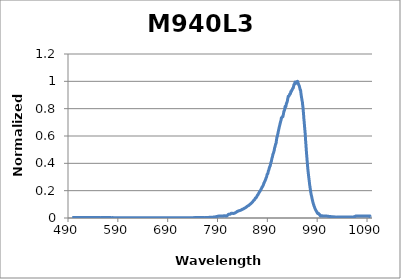
| Category | Normalized Intensity |
|---|---|
| 498.55860471 | 0.004 |
| 498.71212789 | 0.004 |
| 498.86566035 | 0.004 |
| 499.01920208 | 0.004 |
| 499.17275308 | 0.004 |
| 499.32631335 | 0.004 |
| 499.47988288 | 0.004 |
| 499.63346167 | 0.004 |
| 499.78704972 | 0.004 |
| 499.94064703 | 0.004 |
| 500.0942536 | 0.004 |
| 500.24786941 | 0.004 |
| 500.40149447 | 0.004 |
| 500.55512877 | 0.004 |
| 500.70877232 | 0.004 |
| 500.8624251 | 0.004 |
| 501.01608712 | 0.004 |
| 501.16975838 | 0.004 |
| 501.32343886 | 0.004 |
| 501.47712857 | 0.004 |
| 501.63082751 | 0.004 |
| 501.78453567 | 0.004 |
| 501.93825305 | 0.004 |
| 502.09197964 | 0.004 |
| 502.24571545 | 0.004 |
| 502.39946046 | 0.004 |
| 502.55321469 | 0.004 |
| 502.70697812 | 0.004 |
| 502.86075075 | 0.004 |
| 503.01453258 | 0.004 |
| 503.1683236 | 0.004 |
| 503.32212382 | 0.004 |
| 503.47593323 | 0.004 |
| 503.62975183 | 0.004 |
| 503.78357961 | 0.004 |
| 503.93741657 | 0.004 |
| 504.09126271 | 0.004 |
| 504.24511803 | 0.004 |
| 504.39898252 | 0.004 |
| 504.55285618 | 0.004 |
| 504.70673901 | 0.004 |
| 504.860631 | 0.004 |
| 505.01453216 | 0.004 |
| 505.16844247 | 0.004 |
| 505.32236194 | 0.004 |
| 505.47629056 | 0.004 |
| 505.63022834 | 0.004 |
| 505.78417526 | 0.004 |
| 505.93813132 | 0.004 |
| 506.09209653 | 0.004 |
| 506.24607088 | 0.004 |
| 506.40005436 | 0.004 |
| 506.55404697 | 0.004 |
| 506.70804872 | 0.004 |
| 506.86205959 | 0.004 |
| 507.01607959 | 0.004 |
| 507.17010871 | 0.004 |
| 507.32414695 | 0.004 |
| 507.4781943 | 0.004 |
| 507.63225077 | 0.004 |
| 507.78631635 | 0.004 |
| 507.94039103 | 0.004 |
| 508.09447482 | 0.004 |
| 508.24856771 | 0.004 |
| 508.4026697 | 0.004 |
| 508.55678079 | 0.004 |
| 508.71090097 | 0.004 |
| 508.86503024 | 0.004 |
| 509.0191686 | 0.004 |
| 509.17331604 | 0.004 |
| 509.32747256 | 0.004 |
| 509.48163816 | 0.004 |
| 509.63581284 | 0.004 |
| 509.78999659 | 0.004 |
| 509.94418942 | 0.004 |
| 510.09839131 | 0.004 |
| 510.25260226 | 0.004 |
| 510.40682228 | 0.004 |
| 510.56105135 | 0.004 |
| 510.71528948 | 0.004 |
| 510.86953666 | 0.004 |
| 511.0237929 | 0.004 |
| 511.17805818 | 0.004 |
| 511.33233251 | 0.004 |
| 511.48661587 | 0.004 |
| 511.64090828 | 0.004 |
| 511.79520972 | 0.004 |
| 511.9495202 | 0.004 |
| 512.1038397 | 0.004 |
| 512.25816824 | 0.004 |
| 512.4125058 | 0.004 |
| 512.56685237 | 0.004 |
| 512.72120797 | 0.004 |
| 512.87557259 | 0.004 |
| 513.02994622 | 0.004 |
| 513.18432885 | 0.004 |
| 513.3387205 | 0.004 |
| 513.49312115 | 0.004 |
| 513.6475308 | 0.004 |
| 513.80194945 | 0.004 |
| 513.9563771 | 0.004 |
| 514.11081374 | 0.004 |
| 514.26525937 | 0.004 |
| 514.41971399 | 0.004 |
| 514.57417759 | 0.004 |
| 514.72865017 | 0.004 |
| 514.88313173 | 0.004 |
| 515.03762227 | 0.004 |
| 515.19212178 | 0.004 |
| 515.34663027 | 0.004 |
| 515.50114772 | 0.004 |
| 515.65567413 | 0.004 |
| 515.81020951 | 0.004 |
| 515.96475384 | 0.004 |
| 516.11930713 | 0.004 |
| 516.27386937 | 0.004 |
| 516.42844057 | 0.004 |
| 516.58302071 | 0.004 |
| 516.7376098 | 0.004 |
| 516.89220782 | 0.004 |
| 517.04681479 | 0.004 |
| 517.20143069 | 0.004 |
| 517.35605553 | 0.004 |
| 517.51068929 | 0.004 |
| 517.66533199 | 0.004 |
| 517.81998361 | 0.004 |
| 517.97464415 | 0.004 |
| 518.1293136 | 0.004 |
| 518.28399198 | 0.004 |
| 518.43867927 | 0.004 |
| 518.59337546 | 0.004 |
| 518.74808057 | 0.004 |
| 518.90279458 | 0.004 |
| 519.05751749 | 0.004 |
| 519.2122493 | 0.004 |
| 519.36699001 | 0.004 |
| 519.52173961 | 0.004 |
| 519.6764981 | 0.004 |
| 519.83126547 | 0.004 |
| 519.98604174 | 0.004 |
| 520.14082688 | 0.004 |
| 520.2956209 | 0.004 |
| 520.4504238 | 0.004 |
| 520.60523557 | 0.004 |
| 520.76005621 | 0.004 |
| 520.91488572 | 0.004 |
| 521.06972409 | 0.004 |
| 521.22457133 | 0.004 |
| 521.37942742 | 0.004 |
| 521.53429237 | 0.004 |
| 521.68916618 | 0.004 |
| 521.84404883 | 0.004 |
| 521.99894033 | 0.004 |
| 522.15384068 | 0.004 |
| 522.30874986 | 0.004 |
| 522.46366789 | 0.004 |
| 522.61859475 | 0.004 |
| 522.77353045 | 0.004 |
| 522.92847497 | 0.004 |
| 523.08342833 | 0.004 |
| 523.2383905 | 0.004 |
| 523.3933615 | 0.004 |
| 523.54834132 | 0.004 |
| 523.70332995 | 0.004 |
| 523.8583274 | 0.004 |
| 524.01333366 | 0.004 |
| 524.16834872 | 0.004 |
| 524.32337259 | 0.004 |
| 524.47840526 | 0.004 |
| 524.63344673 | 0.004 |
| 524.788497 | 0.004 |
| 524.94355606 | 0.004 |
| 525.0986239 | 0.004 |
| 525.25370054 | 0.004 |
| 525.40878596 | 0.004 |
| 525.56388016 | 0.004 |
| 525.71898315 | 0.004 |
| 525.8740949 | 0.004 |
| 526.02921543 | 0.004 |
| 526.18434473 | 0.004 |
| 526.3394828 | 0.004 |
| 526.49462963 | 0.004 |
| 526.64978523 | 0.004 |
| 526.80494958 | 0.004 |
| 526.96012269 | 0.004 |
| 527.11530455 | 0.004 |
| 527.27049517 | 0.004 |
| 527.42569452 | 0.004 |
| 527.58090263 | 0.004 |
| 527.73611948 | 0.004 |
| 527.89134506 | 0.004 |
| 528.04657938 | 0.004 |
| 528.20182243 | 0.004 |
| 528.35707422 | 0.004 |
| 528.51233473 | 0.004 |
| 528.66760397 | 0.004 |
| 528.82288192 | 0.004 |
| 528.9781686 | 0.004 |
| 529.13346399 | 0.004 |
| 529.2887681 | 0.004 |
| 529.44408091 | 0.004 |
| 529.59940244 | 0.004 |
| 529.75473267 | 0.004 |
| 529.91007159 | 0.004 |
| 530.06541922 | 0.004 |
| 530.22077555 | 0.004 |
| 530.37614056 | 0.004 |
| 530.53151427 | 0.004 |
| 530.68689667 | 0.004 |
| 530.84228775 | 0.004 |
| 530.99768751 | 0.004 |
| 531.15309595 | 0.004 |
| 531.30851306 | 0.004 |
| 531.46393885 | 0.004 |
| 531.61937331 | 0.004 |
| 531.77481644 | 0.004 |
| 531.93026823 | 0.004 |
| 532.08572868 | 0.004 |
| 532.24119779 | 0.004 |
| 532.39667556 | 0.004 |
| 532.55216198 | 0.004 |
| 532.70765705 | 0.004 |
| 532.86316077 | 0.004 |
| 533.01867313 | 0.004 |
| 533.17419414 | 0.004 |
| 533.32972378 | 0.004 |
| 533.48526206 | 0.004 |
| 533.64080897 | 0.004 |
| 533.79636451 | 0.004 |
| 533.95192868 | 0.004 |
| 534.10750148 | 0.004 |
| 534.26308289 | 0.004 |
| 534.41867293 | 0.004 |
| 534.57427158 | 0.004 |
| 534.72987884 | 0.004 |
| 534.88549472 | 0.004 |
| 535.0411192 | 0.004 |
| 535.19675228 | 0.004 |
| 535.35239397 | 0.004 |
| 535.50804426 | 0.004 |
| 535.66370314 | 0.004 |
| 535.81937061 | 0.004 |
| 535.97504668 | 0.004 |
| 536.13073133 | 0.004 |
| 536.28642457 | 0.004 |
| 536.44212639 | 0.004 |
| 536.59783679 | 0.004 |
| 536.75355576 | 0.004 |
| 536.90928331 | 0.004 |
| 537.06501943 | 0.004 |
| 537.22076411 | 0.004 |
| 537.37651736 | 0.004 |
| 537.53227917 | 0.004 |
| 537.68804954 | 0.004 |
| 537.84382846 | 0.004 |
| 537.99961594 | 0.004 |
| 538.15541197 | 0.004 |
| 538.31121655 | 0.004 |
| 538.46702967 | 0.004 |
| 538.62285133 | 0.004 |
| 538.77868153 | 0.004 |
| 538.93452027 | 0.004 |
| 539.09036754 | 0.004 |
| 539.24622334 | 0.004 |
| 539.40208766 | 0.004 |
| 539.55796052 | 0.004 |
| 539.71384189 | 0.004 |
| 539.86973178 | 0.004 |
| 540.02563019 | 0.004 |
| 540.18153711 | 0.004 |
| 540.33745254 | 0.004 |
| 540.49337648 | 0.004 |
| 540.64930893 | 0.004 |
| 540.80524987 | 0.004 |
| 540.96119931 | 0.004 |
| 541.11715725 | 0.004 |
| 541.27312369 | 0.004 |
| 541.42909861 | 0.004 |
| 541.58508202 | 0.004 |
| 541.74107392 | 0.004 |
| 541.89707429 | 0.004 |
| 542.05308315 | 0.004 |
| 542.20910048 | 0.004 |
| 542.36512628 | 0.004 |
| 542.52116056 | 0.003 |
| 542.6772033 | 0.004 |
| 542.83325451 | 0.003 |
| 542.98931417 | 0.004 |
| 543.1453823 | 0.004 |
| 543.30145888 | 0.004 |
| 543.45754392 | 0.004 |
| 543.6136374 | 0.004 |
| 543.76973934 | 0.003 |
| 543.92584971 | 0.004 |
| 544.08196853 | 0.004 |
| 544.23809579 | 0.004 |
| 544.39423149 | 0.003 |
| 544.55037561 | 0.004 |
| 544.70652817 | 0.003 |
| 544.86268915 | 0.004 |
| 545.01885856 | 0.003 |
| 545.17503639 | 0.004 |
| 545.33122264 | 0.003 |
| 545.48741731 | 0.004 |
| 545.64362039 | 0.003 |
| 545.79983188 | 0.004 |
| 545.95605177 | 0.003 |
| 546.11228007 | 0.004 |
| 546.26851677 | 0.003 |
| 546.42476188 | 0.004 |
| 546.58101537 | 0.003 |
| 546.73727726 | 0.004 |
| 546.89354754 | 0.004 |
| 547.04982621 | 0.004 |
| 547.20611326 | 0.003 |
| 547.36240869 | 0.004 |
| 547.51871251 | 0.003 |
| 547.67502469 | 0.004 |
| 547.83134526 | 0.003 |
| 547.98767419 | 0.003 |
| 548.14401149 | 0.003 |
| 548.30035715 | 0.004 |
| 548.45671117 | 0.003 |
| 548.61307356 | 0.004 |
| 548.7694443 | 0.003 |
| 548.92582339 | 0.004 |
| 549.08221083 | 0.003 |
| 549.23860662 | 0.003 |
| 549.39501075 | 0.003 |
| 549.55142323 | 0.004 |
| 549.70784405 | 0.003 |
| 549.8642732 | 0.004 |
| 550.02071068 | 0.003 |
| 550.17715649 | 0.004 |
| 550.33361063 | 0.003 |
| 550.4900731 | 0.003 |
| 550.64654389 | 0.003 |
| 550.80302299 | 0.003 |
| 550.95951042 | 0.003 |
| 551.11600615 | 0.004 |
| 551.2725102 | 0.003 |
| 551.42902255 | 0.004 |
| 551.5855432 | 0.003 |
| 551.74207216 | 0.004 |
| 551.89860942 | 0.003 |
| 552.05515497 | 0.004 |
| 552.21170882 | 0.003 |
| 552.36827096 | 0.003 |
| 552.52484138 | 0.003 |
| 552.68142009 | 0.003 |
| 552.83800708 | 0.003 |
| 552.99460235 | 0.003 |
| 553.15120589 | 0.003 |
| 553.30781771 | 0.003 |
| 553.46443779 | 0.003 |
| 553.62106615 | 0.003 |
| 553.77770277 | 0.003 |
| 553.93434765 | 0.003 |
| 554.09100079 | 0.003 |
| 554.24766218 | 0.003 |
| 554.40433183 | 0.003 |
| 554.56100973 | 0.003 |
| 554.71769588 | 0.003 |
| 554.87439027 | 0.003 |
| 555.0310929 | 0.003 |
| 555.18780377 | 0.003 |
| 555.34452288 | 0.003 |
| 555.50125022 | 0.003 |
| 555.65798579 | 0.003 |
| 555.81472958 | 0.003 |
| 555.97148161 | 0.003 |
| 556.12824185 | 0.003 |
| 556.28501031 | 0.003 |
| 556.44178699 | 0.003 |
| 556.59857188 | 0.003 |
| 556.75536498 | 0.003 |
| 556.91216629 | 0.003 |
| 557.0689758 | 0.003 |
| 557.22579352 | 0.003 |
| 557.38261943 | 0.003 |
| 557.53945354 | 0.003 |
| 557.69629584 | 0.003 |
| 557.85314633 | 0.003 |
| 558.01000501 | 0.003 |
| 558.16687188 | 0.003 |
| 558.32374692 | 0.003 |
| 558.48063015 | 0.003 |
| 558.63752155 | 0.003 |
| 558.79442112 | 0.003 |
| 558.95132886 | 0.003 |
| 559.10824477 | 0.003 |
| 559.26516885 | 0.003 |
| 559.42210108 | 0.003 |
| 559.57904148 | 0.003 |
| 559.73599003 | 0.003 |
| 559.89294673 | 0.003 |
| 560.04991159 | 0.003 |
| 560.20688459 | 0.003 |
| 560.36386574 | 0.003 |
| 560.52085502 | 0.003 |
| 560.67785245 | 0.003 |
| 560.83485801 | 0.003 |
| 560.99187171 | 0.003 |
| 561.14889353 | 0.003 |
| 561.30592349 | 0.003 |
| 561.46296156 | 0.003 |
| 561.62000776 | 0.003 |
| 561.77706208 | 0.003 |
| 561.93412451 | 0.003 |
| 562.09119506 | 0.003 |
| 562.24827371 | 0.003 |
| 562.40536048 | 0.003 |
| 562.56245535 | 0.003 |
| 562.71955832 | 0.003 |
| 562.87666938 | 0.003 |
| 563.03378855 | 0.003 |
| 563.19091581 | 0.003 |
| 563.34805115 | 0.003 |
| 563.50519459 | 0.003 |
| 563.66234611 | 0.003 |
| 563.81950571 | 0.003 |
| 563.97667339 | 0.003 |
| 564.13384914 | 0.003 |
| 564.29103297 | 0.003 |
| 564.44822487 | 0.003 |
| 564.60542483 | 0.003 |
| 564.76263286 | 0.003 |
| 564.91984896 | 0.003 |
| 565.07707311 | 0.003 |
| 565.23430531 | 0.003 |
| 565.39154557 | 0.003 |
| 565.54879388 | 0.003 |
| 565.70605024 | 0.003 |
| 565.86331464 | 0.003 |
| 566.02058708 | 0.003 |
| 566.17786756 | 0.003 |
| 566.33515608 | 0.003 |
| 566.49245263 | 0.003 |
| 566.64975721 | 0.003 |
| 566.80706982 | 0.003 |
| 566.96439045 | 0.003 |
| 567.1217191 | 0.003 |
| 567.27905578 | 0.003 |
| 567.43640046 | 0.003 |
| 567.59375316 | 0.003 |
| 567.75111388 | 0.003 |
| 567.90848259 | 0.003 |
| 568.06585932 | 0.003 |
| 568.22324404 | 0.003 |
| 568.38063676 | 0.003 |
| 568.53803748 | 0.003 |
| 568.6954462 | 0.003 |
| 568.8528629 | 0.003 |
| 569.01028759 | 0.003 |
| 569.16772026 | 0.003 |
| 569.32516092 | 0.003 |
| 569.48260955 | 0.003 |
| 569.64006616 | 0.003 |
| 569.79753074 | 0.003 |
| 569.9550033 | 0.003 |
| 570.11248382 | 0.003 |
| 570.2699723 | 0.003 |
| 570.42746875 | 0.003 |
| 570.58497315 | 0.003 |
| 570.74248551 | 0.003 |
| 570.90000583 | 0.003 |
| 571.05753409 | 0.003 |
| 571.2150703 | 0.003 |
| 571.37261446 | 0.003 |
| 571.53016655 | 0.003 |
| 571.68772659 | 0.003 |
| 571.84529456 | 0.003 |
| 572.00287047 | 0.003 |
| 572.1604543 | 0.003 |
| 572.31804606 | 0.003 |
| 572.47564575 | 0.003 |
| 572.63325336 | 0.003 |
| 572.79086888 | 0.003 |
| 572.94849232 | 0.003 |
| 573.10612368 | 0.003 |
| 573.26376295 | 0.003 |
| 573.42141012 | 0.003 |
| 573.5790652 | 0.003 |
| 573.73672817 | 0.003 |
| 573.89439905 | 0.003 |
| 574.05207782 | 0.003 |
| 574.20976449 | 0.003 |
| 574.36745905 | 0.003 |
| 574.52516149 | 0.003 |
| 574.68287182 | 0.003 |
| 574.84059003 | 0.003 |
| 574.99831612 | 0.003 |
| 575.15605008 | 0.003 |
| 575.31379192 | 0.003 |
| 575.47154162 | 0.003 |
| 575.6292992 | 0.003 |
| 575.78706464 | 0.003 |
| 575.94483794 | 0.003 |
| 576.1026191 | 0.003 |
| 576.26040811 | 0.003 |
| 576.41820498 | 0.003 |
| 576.5760097 | 0.003 |
| 576.73382226 | 0.003 |
| 576.89164267 | 0.003 |
| 577.04947092 | 0.003 |
| 577.20730701 | 0.003 |
| 577.36515094 | 0.003 |
| 577.52300269 | 0.003 |
| 577.68086228 | 0.003 |
| 577.8387297 | 0.003 |
| 577.99660494 | 0.003 |
| 578.154488 | 0.003 |
| 578.31237888 | 0.003 |
| 578.47027758 | 0.003 |
| 578.62818409 | 0.003 |
| 578.7860984 | 0.003 |
| 578.94402053 | 0.003 |
| 579.10195046 | 0.003 |
| 579.25988819 | 0.003 |
| 579.41783373 | 0.003 |
| 579.57578705 | 0.003 |
| 579.73374817 | 0.003 |
| 579.89171708 | 0.003 |
| 580.04969378 | 0.003 |
| 580.20767826 | 0.003 |
| 580.36567052 | 0.003 |
| 580.52367056 | 0.003 |
| 580.68167838 | 0.003 |
| 580.83969397 | 0.003 |
| 580.99771733 | 0.003 |
| 581.15574846 | 0.002 |
| 581.31378735 | 0.003 |
| 581.47183401 | 0.003 |
| 581.62988842 | 0.003 |
| 581.78795059 | 0.003 |
| 581.94602051 | 0.003 |
| 582.10409818 | 0.003 |
| 582.2621836 | 0.003 |
| 582.42027676 | 0.003 |
| 582.57837766 | 0.003 |
| 582.73648631 | 0.003 |
| 582.89460269 | 0.003 |
| 583.0527268 | 0.003 |
| 583.21085864 | 0.003 |
| 583.36899821 | 0.002 |
| 583.5271455 | 0.003 |
| 583.68530052 | 0.002 |
| 583.84346325 | 0.003 |
| 584.0016337 | 0.003 |
| 584.15981186 | 0.003 |
| 584.31799773 | 0.002 |
| 584.47619131 | 0.003 |
| 584.6343926 | 0.003 |
| 584.79260158 | 0.003 |
| 584.95081827 | 0.003 |
| 585.10904265 | 0.003 |
| 585.26727472 | 0.002 |
| 585.42551448 | 0.003 |
| 585.58376193 | 0.002 |
| 585.74201707 | 0.003 |
| 585.90027988 | 0.003 |
| 586.05855038 | 0.003 |
| 586.21682855 | 0.003 |
| 586.37511439 | 0.003 |
| 586.5334079 | 0.002 |
| 586.69170908 | 0.003 |
| 586.85001793 | 0.002 |
| 587.00833444 | 0.003 |
| 587.1666586 | 0.002 |
| 587.32499042 | 0.003 |
| 587.4833299 | 0.002 |
| 587.64167702 | 0.003 |
| 587.80003179 | 0.002 |
| 587.95839421 | 0.003 |
| 588.11676426 | 0.002 |
| 588.27514196 | 0.002 |
| 588.43352729 | 0.002 |
| 588.59192025 | 0.003 |
| 588.75032085 | 0.002 |
| 588.90872907 | 0.003 |
| 589.06714492 | 0.002 |
| 589.22556838 | 0.003 |
| 589.38399947 | 0.003 |
| 589.54243817 | 0.003 |
| 589.70088449 | 0.002 |
| 589.85933841 | 0.003 |
| 590.01779994 | 0.002 |
| 590.17626908 | 0.002 |
| 590.33474582 | 0.002 |
| 590.49323015 | 0.003 |
| 590.65172209 | 0.002 |
| 590.81022161 | 0.002 |
| 590.96872873 | 0.002 |
| 591.12724343 | 0.002 |
| 591.28576572 | 0.002 |
| 591.44429559 | 0.002 |
| 591.60283303 | 0.002 |
| 591.76137806 | 0.002 |
| 591.91993065 | 0.002 |
| 592.07849082 | 0.002 |
| 592.23705855 | 0.002 |
| 592.39563385 | 0.002 |
| 592.55421671 | 0.002 |
| 592.71280712 | 0.002 |
| 592.8714051 | 0.002 |
| 593.03001062 | 0.002 |
| 593.1886237 | 0.002 |
| 593.34724432 | 0.002 |
| 593.50587249 | 0.002 |
| 593.6645082 | 0.002 |
| 593.82315145 | 0.002 |
| 593.98180223 | 0.002 |
| 594.14046055 | 0.002 |
| 594.29912639 | 0.002 |
| 594.45779977 | 0.002 |
| 594.61648067 | 0.002 |
| 594.77516909 | 0.002 |
| 594.93386502 | 0.002 |
| 595.09256848 | 0.002 |
| 595.25127944 | 0.002 |
| 595.40999792 | 0.002 |
| 595.56872391 | 0.002 |
| 595.72745739 | 0.002 |
| 595.88619838 | 0.002 |
| 596.04494687 | 0.002 |
| 596.20370286 | 0.002 |
| 596.36246633 | 0.002 |
| 596.5212373 | 0.002 |
| 596.68001576 | 0.002 |
| 596.83880169 | 0.002 |
| 596.99759511 | 0.002 |
| 597.15639601 | 0.002 |
| 597.31520439 | 0.002 |
| 597.47402024 | 0.002 |
| 597.63284355 | 0.002 |
| 597.79167434 | 0.002 |
| 597.95051259 | 0.002 |
| 598.1093583 | 0.002 |
| 598.26821147 | 0.002 |
| 598.42707209 | 0.002 |
| 598.58594017 | 0.002 |
| 598.7448157 | 0.002 |
| 598.90369867 | 0.002 |
| 599.06258909 | 0.002 |
| 599.22148695 | 0.002 |
| 599.38039225 | 0.002 |
| 599.53930499 | 0.002 |
| 599.69822516 | 0.002 |
| 599.85715275 | 0.002 |
| 600.01608778 | 0.002 |
| 600.17503023 | 0.002 |
| 600.3339801 | 0.002 |
| 600.49293739 | 0.002 |
| 600.6519021 | 0.002 |
| 600.81087421 | 0.002 |
| 600.96985374 | 0.002 |
| 601.12884068 | 0.002 |
| 601.28783502 | 0.002 |
| 601.44683676 | 0.002 |
| 601.6058459 | 0.002 |
| 601.76486243 | 0.002 |
| 601.92388636 | 0.002 |
| 602.08291768 | 0.002 |
| 602.24195639 | 0.002 |
| 602.40100248 | 0.002 |
| 602.56005595 | 0.002 |
| 602.7191168 | 0.002 |
| 602.87818503 | 0.002 |
| 603.03726062 | 0.002 |
| 603.19634359 | 0.002 |
| 603.35543393 | 0.002 |
| 603.51453163 | 0.002 |
| 603.67363669 | 0.002 |
| 603.83274911 | 0.002 |
| 603.99186889 | 0.002 |
| 604.15099602 | 0.002 |
| 604.3101305 | 0.002 |
| 604.46927232 | 0.002 |
| 604.62842149 | 0.002 |
| 604.787578 | 0.002 |
| 604.94674185 | 0.002 |
| 605.10591304 | 0.002 |
| 605.26509156 | 0.002 |
| 605.42427741 | 0.002 |
| 605.58347059 | 0.002 |
| 605.74267109 | 0.002 |
| 605.90187891 | 0.002 |
| 606.06109405 | 0.002 |
| 606.22031651 | 0.002 |
| 606.37954628 | 0.002 |
| 606.53878335 | 0.002 |
| 606.69802774 | 0.002 |
| 606.85727943 | 0.002 |
| 607.01653842 | 0.002 |
| 607.17580471 | 0.002 |
| 607.3350783 | 0.002 |
| 607.49435918 | 0.002 |
| 607.65364735 | 0.002 |
| 607.81294281 | 0.002 |
| 607.97224555 | 0.002 |
| 608.13155557 | 0.002 |
| 608.29087287 | 0.002 |
| 608.45019745 | 0.002 |
| 608.6095293 | 0.002 |
| 608.76886842 | 0.002 |
| 608.9282148 | 0.002 |
| 609.08756845 | 0.002 |
| 609.24692937 | 0.002 |
| 609.40629754 | 0.002 |
| 609.56567296 | 0.002 |
| 609.72505564 | 0.002 |
| 609.88444557 | 0.002 |
| 610.04384275 | 0.002 |
| 610.20324717 | 0.002 |
| 610.36265883 | 0.002 |
| 610.52207774 | 0.002 |
| 610.68150387 | 0.002 |
| 610.84093724 | 0.002 |
| 611.00037784 | 0.002 |
| 611.15982567 | 0.002 |
| 611.31928072 | 0.002 |
| 611.47874299 | 0.002 |
| 611.63821248 | 0.002 |
| 611.79768919 | 0.002 |
| 611.95717311 | 0.002 |
| 612.11666424 | 0.002 |
| 612.27616258 | 0.002 |
| 612.43566812 | 0.002 |
| 612.59518086 | 0.002 |
| 612.7547008 | 0.002 |
| 612.91422794 | 0.002 |
| 613.07376227 | 0.002 |
| 613.23330379 | 0.002 |
| 613.39285249 | 0.002 |
| 613.55240839 | 0.002 |
| 613.71197146 | 0.002 |
| 613.87154171 | 0.002 |
| 614.03111914 | 0.002 |
| 614.19070374 | 0.002 |
| 614.35029551 | 0.002 |
| 614.50989444 | 0.002 |
| 614.66950054 | 0.002 |
| 614.82911381 | 0.002 |
| 614.98873423 | 0.002 |
| 615.1483618 | 0.002 |
| 615.30799653 | 0.002 |
| 615.46763841 | 0.002 |
| 615.62728744 | 0.002 |
| 615.78694361 | 0.002 |
| 615.94660692 | 0.002 |
| 616.10627737 | 0.002 |
| 616.26595496 | 0.002 |
| 616.42563968 | 0.002 |
| 616.58533153 | 0.002 |
| 616.74503051 | 0.002 |
| 616.90473661 | 0.002 |
| 617.06444983 | 0.002 |
| 617.22417017 | 0.002 |
| 617.38389763 | 0.002 |
| 617.5436322 | 0.002 |
| 617.70337388 | 0.002 |
| 617.86312266 | 0.002 |
| 618.02287855 | 0.002 |
| 618.18264155 | 0.002 |
| 618.34241164 | 0.002 |
| 618.50218882 | 0.002 |
| 618.6619731 | 0.002 |
| 618.82176447 | 0.002 |
| 618.98156293 | 0.002 |
| 619.14136847 | 0.002 |
| 619.30118109 | 0.002 |
| 619.46100079 | 0.002 |
| 619.62082757 | 0.002 |
| 619.78066142 | 0.002 |
| 619.94050234 | 0.002 |
| 620.10035033 | 0.002 |
| 620.26020538 | 0.002 |
| 620.42006749 | 0.002 |
| 620.57993666 | 0.002 |
| 620.73981288 | 0.002 |
| 620.89969616 | 0.002 |
| 621.05958649 | 0.002 |
| 621.21948387 | 0.002 |
| 621.37938829 | 0.002 |
| 621.53929975 | 0.002 |
| 621.69921825 | 0.002 |
| 621.85914379 | 0.002 |
| 622.01907636 | 0.002 |
| 622.17901596 | 0.002 |
| 622.33896258 | 0.002 |
| 622.49891623 | 0.002 |
| 622.6588769 | 0.002 |
| 622.8188446 | 0.002 |
| 622.9788193 | 0.002 |
| 623.13880102 | 0.002 |
| 623.29878975 | 0.002 |
| 623.45878548 | 0.002 |
| 623.61878822 | 0.002 |
| 623.77879797 | 0.002 |
| 623.93881471 | 0.002 |
| 624.09883844 | 0.002 |
| 624.25886917 | 0.002 |
| 624.41890689 | 0.002 |
| 624.57895159 | 0.002 |
| 624.73900328 | 0.002 |
| 624.89906196 | 0.002 |
| 625.05912761 | 0.002 |
| 625.21920023 | 0.002 |
| 625.37927983 | 0.002 |
| 625.5393664 | 0.002 |
| 625.69945993 | 0.002 |
| 625.85956043 | 0.002 |
| 626.01966789 | 0.002 |
| 626.17978231 | 0.002 |
| 626.33990369 | 0.002 |
| 626.50003202 | 0.002 |
| 626.6601673 | 0.002 |
| 626.82030952 | 0.002 |
| 626.98045869 | 0.002 |
| 627.1406148 | 0.002 |
| 627.30077785 | 0.002 |
| 627.46094784 | 0.002 |
| 627.62112475 | 0.002 |
| 627.7813086 | 0.002 |
| 627.94149938 | 0.002 |
| 628.10169707 | 0.002 |
| 628.2619017 | 0.002 |
| 628.42211323 | 0.002 |
| 628.58233169 | 0.002 |
| 628.74255706 | 0.002 |
| 628.90278933 | 0.002 |
| 629.06302852 | 0.002 |
| 629.22327461 | 0.002 |
| 629.3835276 | 0.002 |
| 629.54378749 | 0.002 |
| 629.70405427 | 0.002 |
| 629.86432795 | 0.002 |
| 630.02460852 | 0.002 |
| 630.18489597 | 0.002 |
| 630.34519031 | 0.002 |
| 630.50549153 | 0.002 |
| 630.66579963 | 0.002 |
| 630.8261146 | 0.002 |
| 630.98643645 | 0.002 |
| 631.14676516 | 0.002 |
| 631.30710075 | 0.002 |
| 631.4674432 | 0.002 |
| 631.62779251 | 0.002 |
| 631.78814867 | 0.002 |
| 631.9485117 | 0.002 |
| 632.10888157 | 0.002 |
| 632.2692583 | 0.002 |
| 632.42964187 | 0.002 |
| 632.59003229 | 0.002 |
| 632.75042955 | 0.002 |
| 632.91083365 | 0.002 |
| 633.07124458 | 0.002 |
| 633.23166235 | 0.002 |
| 633.39208694 | 0.002 |
| 633.55251837 | 0.002 |
| 633.71295661 | 0.002 |
| 633.87340168 | 0.002 |
| 634.03385357 | 0.002 |
| 634.19431227 | 0.002 |
| 634.35477779 | 0.002 |
| 634.51525011 | 0.002 |
| 634.67572925 | 0.002 |
| 634.83621518 | 0.002 |
| 634.99670792 | 0.002 |
| 635.15720746 | 0.002 |
| 635.31771379 | 0.002 |
| 635.47822692 | 0.002 |
| 635.63874683 | 0.002 |
| 635.79927353 | 0.002 |
| 635.95980702 | 0.002 |
| 636.12034729 | 0.002 |
| 636.28089434 | 0.002 |
| 636.44144816 | 0.002 |
| 636.60200875 | 0.002 |
| 636.76257612 | 0.002 |
| 636.92315025 | 0.002 |
| 637.08373114 | 0.002 |
| 637.2443188 | 0.002 |
| 637.40491322 | 0.002 |
| 637.56551439 | 0.002 |
| 637.72612231 | 0.002 |
| 637.88673699 | 0.002 |
| 638.04735841 | 0.002 |
| 638.20798657 | 0.002 |
| 638.36862148 | 0.002 |
| 638.52926313 | 0.002 |
| 638.68991151 | 0.002 |
| 638.85056662 | 0.002 |
| 639.01122847 | 0.002 |
| 639.17189704 | 0.002 |
| 639.33257233 | 0.002 |
| 639.49325435 | 0.002 |
| 639.65394308 | 0.002 |
| 639.81463853 | 0.002 |
| 639.9753407 | 0.002 |
| 640.13604957 | 0.002 |
| 640.29676515 | 0.002 |
| 640.45748743 | 0.002 |
| 640.61821642 | 0.002 |
| 640.7789521 | 0.002 |
| 640.93969448 | 0.002 |
| 641.10044356 | 0.002 |
| 641.26119932 | 0.002 |
| 641.42196177 | 0.002 |
| 641.5827309 | 0.002 |
| 641.74350672 | 0.002 |
| 641.90428921 | 0.002 |
| 642.06507838 | 0.002 |
| 642.22587422 | 0.002 |
| 642.38667674 | 0.002 |
| 642.54748592 | 0.002 |
| 642.70830176 | 0.002 |
| 642.86912426 | 0.002 |
| 643.02995343 | 0.002 |
| 643.19078925 | 0.002 |
| 643.35163172 | 0.002 |
| 643.51248084 | 0.002 |
| 643.67333661 | 0.002 |
| 643.83419902 | 0.002 |
| 643.99506807 | 0.002 |
| 644.15594377 | 0.002 |
| 644.3168261 | 0.002 |
| 644.47771506 | 0.002 |
| 644.63861065 | 0.002 |
| 644.79951287 | 0.002 |
| 644.96042171 | 0.002 |
| 645.12133717 | 0.002 |
| 645.28225925 | 0.002 |
| 645.44318795 | 0.002 |
| 645.60412326 | 0.002 |
| 645.76506518 | 0.002 |
| 645.92601371 | 0.002 |
| 646.08696884 | 0.002 |
| 646.24793057 | 0.002 |
| 646.4088989 | 0.002 |
| 646.56987383 | 0.002 |
| 646.73085535 | 0.002 |
| 646.89184346 | 0.002 |
| 647.05283816 | 0.002 |
| 647.21383944 | 0.002 |
| 647.3748473 | 0.002 |
| 647.53586174 | 0.002 |
| 647.69688276 | 0.002 |
| 647.85791035 | 0.002 |
| 648.0189445 | 0.002 |
| 648.17998523 | 0.002 |
| 648.34103252 | 0.002 |
| 648.50208637 | 0.002 |
| 648.66314678 | 0.002 |
| 648.82421375 | 0.002 |
| 648.98528727 | 0.002 |
| 649.14636733 | 0.002 |
| 649.30745395 | 0.002 |
| 649.46854711 | 0.002 |
| 649.62964681 | 0.002 |
| 649.79075305 | 0.002 |
| 649.95186582 | 0.002 |
| 650.11298513 | 0.002 |
| 650.27411097 | 0.002 |
| 650.43524333 | 0.002 |
| 650.59638222 | 0.002 |
| 650.75752763 | 0.002 |
| 650.91867956 | 0.002 |
| 651.079838 | 0.002 |
| 651.24100296 | 0.002 |
| 651.40217443 | 0.002 |
| 651.5633524 | 0.002 |
| 651.72453688 | 0.002 |
| 651.88572786 | 0.002 |
| 652.04692534 | 0.002 |
| 652.20812931 | 0.002 |
| 652.36933978 | 0.002 |
| 652.53055673 | 0.002 |
| 652.69178018 | 0.002 |
| 652.8530101 | 0.002 |
| 653.01424651 | 0.002 |
| 653.1754894 | 0.002 |
| 653.33673876 | 0.002 |
| 653.4979946 | 0.002 |
| 653.6592569 | 0.002 |
| 653.82052567 | 0.002 |
| 653.98180091 | 0.002 |
| 654.14308261 | 0.002 |
| 654.30437076 | 0.002 |
| 654.46566538 | 0.002 |
| 654.62696644 | 0.002 |
| 654.78827395 | 0.002 |
| 654.94958792 | 0.002 |
| 655.11090832 | 0.002 |
| 655.27223517 | 0.002 |
| 655.43356845 | 0.002 |
| 655.59490817 | 0.002 |
| 655.75625433 | 0.002 |
| 655.91760691 | 0.002 |
| 656.07896592 | 0.002 |
| 656.24033136 | 0.002 |
| 656.40170321 | 0.002 |
| 656.56308149 | 0.002 |
| 656.72446618 | 0.002 |
| 656.88585728 | 0.002 |
| 657.04725479 | 0.002 |
| 657.20865871 | 0.002 |
| 657.37006904 | 0.002 |
| 657.53148576 | 0.002 |
| 657.69290888 | 0.002 |
| 657.8543384 | 0.002 |
| 658.01577432 | 0.002 |
| 658.17721662 | 0.002 |
| 658.33866531 | 0.002 |
| 658.50012038 | 0.002 |
| 658.66158183 | 0.002 |
| 658.82304967 | 0.002 |
| 658.98452387 | 0.002 |
| 659.14600446 | 0.002 |
| 659.30749141 | 0.002 |
| 659.46898472 | 0.002 |
| 659.63048441 | 0.002 |
| 659.79199045 | 0.002 |
| 659.95350285 | 0.002 |
| 660.11502161 | 0.002 |
| 660.27654672 | 0.002 |
| 660.43807818 | 0.002 |
| 660.59961599 | 0.002 |
| 660.76116014 | 0.002 |
| 660.92271063 | 0.002 |
| 661.08426746 | 0.002 |
| 661.24583063 | 0.002 |
| 661.40740013 | 0.002 |
| 661.56897596 | 0.002 |
| 661.73055811 | 0.002 |
| 661.89214659 | 0.002 |
| 662.05374139 | 0.002 |
| 662.21534251 | 0.002 |
| 662.37694995 | 0.002 |
| 662.5385637 | 0.002 |
| 662.70018375 | 0.002 |
| 662.86181012 | 0.002 |
| 663.02344279 | 0.002 |
| 663.18508176 | 0.002 |
| 663.34672703 | 0.002 |
| 663.50837859 | 0.002 |
| 663.67003645 | 0.002 |
| 663.8317006 | 0.002 |
| 663.99337103 | 0.002 |
| 664.15504775 | 0.002 |
| 664.31673075 | 0.002 |
| 664.47842003 | 0.002 |
| 664.64011558 | 0.002 |
| 664.80181741 | 0.002 |
| 664.9635255 | 0.002 |
| 665.12523986 | 0.002 |
| 665.28696049 | 0.002 |
| 665.44868738 | 0.002 |
| 665.61042053 | 0.002 |
| 665.77215993 | 0.002 |
| 665.93390559 | 0.002 |
| 666.09565749 | 0.002 |
| 666.25741564 | 0.002 |
| 666.41918004 | 0.002 |
| 666.58095068 | 0.002 |
| 666.74272755 | 0.002 |
| 666.90451066 | 0.002 |
| 667.06630001 | 0.002 |
| 667.22809558 | 0.002 |
| 667.38989738 | 0.002 |
| 667.55170541 | 0.002 |
| 667.71351965 | 0.002 |
| 667.87534012 | 0.002 |
| 668.0371668 | 0.002 |
| 668.19899969 | 0.002 |
| 668.36083879 | 0.002 |
| 668.5226841 | 0.002 |
| 668.68453562 | 0.002 |
| 668.84639333 | 0.002 |
| 669.00825725 | 0.002 |
| 669.17012736 | 0.002 |
| 669.33200366 | 0.002 |
| 669.49388615 | 0.002 |
| 669.65577483 | 0.002 |
| 669.81766969 | 0.002 |
| 669.97957074 | 0.002 |
| 670.14147796 | 0.002 |
| 670.30339136 | 0.002 |
| 670.46531093 | 0.002 |
| 670.62723667 | 0.002 |
| 670.78916858 | 0.002 |
| 670.95110665 | 0.002 |
| 671.11305088 | 0.002 |
| 671.27500127 | 0.002 |
| 671.43695782 | 0.002 |
| 671.59892052 | 0.002 |
| 671.76088937 | 0.002 |
| 671.92286436 | 0.002 |
| 672.0848455 | 0.002 |
| 672.24683279 | 0.002 |
| 672.40882621 | 0.002 |
| 672.57082576 | 0.002 |
| 672.73283145 | 0.002 |
| 672.89484327 | 0.002 |
| 673.05686121 | 0.002 |
| 673.21888528 | 0.002 |
| 673.38091547 | 0.002 |
| 673.54295178 | 0.002 |
| 673.70499421 | 0.002 |
| 673.86704275 | 0.002 |
| 674.02909739 | 0.002 |
| 674.19115815 | 0.002 |
| 674.353225 | 0.002 |
| 674.51529796 | 0.002 |
| 674.67737702 | 0.002 |
| 674.83946218 | 0.002 |
| 675.00155342 | 0.002 |
| 675.16365076 | 0.002 |
| 675.32575418 | 0.002 |
| 675.48786369 | 0.002 |
| 675.64997928 | 0.002 |
| 675.81210094 | 0.002 |
| 675.97422868 | 0.002 |
| 676.1363625 | 0.002 |
| 676.29850238 | 0.002 |
| 676.46064834 | 0.002 |
| 676.62280035 | 0.002 |
| 676.78495843 | 0.002 |
| 676.94712256 | 0.002 |
| 677.10929275 | 0.002 |
| 677.271469 | 0.002 |
| 677.43365129 | 0.002 |
| 677.59583963 | 0.002 |
| 677.75803402 | 0.002 |
| 677.92023444 | 0.002 |
| 678.08244091 | 0.002 |
| 678.24465341 | 0.002 |
| 678.40687194 | 0.002 |
| 678.5690965 | 0.002 |
| 678.73132709 | 0.002 |
| 678.8935637 | 0.002 |
| 679.05580634 | 0.002 |
| 679.21805499 | 0.002 |
| 679.38030966 | 0.002 |
| 679.54257034 | 0.002 |
| 679.70483703 | 0.002 |
| 679.86710973 | 0.002 |
| 680.02938843 | 0.002 |
| 680.19167313 | 0.002 |
| 680.35396383 | 0.002 |
| 680.51626053 | 0.002 |
| 680.67856322 | 0.002 |
| 680.8408719 | 0.002 |
| 681.00318657 | 0.002 |
| 681.16550722 | 0.002 |
| 681.32783385 | 0.002 |
| 681.49016646 | 0.002 |
| 681.65250504 | 0.002 |
| 681.8148496 | 0.002 |
| 681.97720013 | 0.002 |
| 682.13955663 | 0.002 |
| 682.30191909 | 0.002 |
| 682.46428751 | 0.002 |
| 682.62666188 | 0.002 |
| 682.78904222 | 0.002 |
| 682.95142851 | 0.002 |
| 683.11382074 | 0.002 |
| 683.27621893 | 0.002 |
| 683.43862305 | 0.002 |
| 683.60103312 | 0.002 |
| 683.76344913 | 0.002 |
| 683.92587107 | 0.002 |
| 684.08829895 | 0.002 |
| 684.25073275 | 0.002 |
| 684.41317249 | 0.002 |
| 684.57561814 | 0.002 |
| 684.73806972 | 0.002 |
| 684.90052722 | 0.002 |
| 685.06299063 | 0.002 |
| 685.22545995 | 0.002 |
| 685.38793519 | 0.002 |
| 685.55041633 | 0.002 |
| 685.71290337 | 0.002 |
| 685.87539632 | 0.002 |
| 686.03789516 | 0.002 |
| 686.2003999 | 0.002 |
| 686.36291054 | 0.002 |
| 686.52542706 | 0.002 |
| 686.68794947 | 0.002 |
| 686.85047776 | 0.002 |
| 687.01301194 | 0.002 |
| 687.17555199 | 0.002 |
| 687.33809792 | 0.002 |
| 687.50064972 | 0.002 |
| 687.66320739 | 0.002 |
| 687.82577093 | 0.002 |
| 687.98834033 | 0.002 |
| 688.15091559 | 0.002 |
| 688.31349672 | 0.002 |
| 688.47608369 | 0.002 |
| 688.63867652 | 0.002 |
| 688.8012752 | 0.002 |
| 688.96387973 | 0.002 |
| 689.1264901 | 0.002 |
| 689.28910631 | 0.002 |
| 689.45172836 | 0.002 |
| 689.61435625 | 0.002 |
| 689.77698997 | 0.002 |
| 689.93962951 | 0.002 |
| 690.10227489 | 0.002 |
| 690.26492609 | 0.002 |
| 690.42758311 | 0.002 |
| 690.59024595 | 0.002 |
| 690.7529146 | 0.002 |
| 690.91558907 | 0.002 |
| 691.07826934 | 0.002 |
| 691.24095543 | 0.002 |
| 691.40364732 | 0.002 |
| 691.566345 | 0.002 |
| 691.72904849 | 0.002 |
| 691.89175777 | 0.002 |
| 692.05447285 | 0.002 |
| 692.21719371 | 0.002 |
| 692.37992037 | 0.002 |
| 692.5426528 | 0.002 |
| 692.70539102 | 0.002 |
| 692.86813501 | 0.002 |
| 693.03088479 | 0.002 |
| 693.19364033 | 0.002 |
| 693.35640164 | 0.002 |
| 693.51916872 | 0.002 |
| 693.68194157 | 0.002 |
| 693.84472017 | 0.002 |
| 694.00750454 | 0.002 |
| 694.17029466 | 0.002 |
| 694.33309053 | 0.002 |
| 694.49589215 | 0.002 |
| 694.65869952 | 0.002 |
| 694.82151263 | 0.002 |
| 694.98433149 | 0.002 |
| 695.14715608 | 0.002 |
| 695.30998641 | 0.002 |
| 695.47282247 | 0.002 |
| 695.63566426 | 0.002 |
| 695.79851177 | 0.002 |
| 695.96136502 | 0.002 |
| 696.12422398 | 0.002 |
| 696.28708866 | 0.002 |
| 696.44995905 | 0.002 |
| 696.61283516 | 0.002 |
| 696.77571698 | 0.002 |
| 696.93860451 | 0.002 |
| 697.10149774 | 0.002 |
| 697.26439667 | 0.002 |
| 697.4273013 | 0.002 |
| 697.59021162 | 0.002 |
| 697.75312764 | 0.002 |
| 697.91604935 | 0.002 |
| 698.07897674 | 0.002 |
| 698.24190982 | 0.002 |
| 698.40484858 | 0.002 |
| 698.56779301 | 0.002 |
| 698.73074313 | 0.002 |
| 698.89369891 | 0.002 |
| 699.05666037 | 0.002 |
| 699.21962749 | 0.002 |
| 699.38260028 | 0.002 |
| 699.54557872 | 0.002 |
| 699.70856283 | 0.002 |
| 699.87155259 | 0.002 |
| 700.034548 | 0.002 |
| 700.19754907 | 0.002 |
| 700.36055578 | 0.002 |
| 700.52356813 | 0.002 |
| 700.68658613 | 0.002 |
| 700.84960976 | 0.002 |
| 701.01263903 | 0.002 |
| 701.17567393 | 0.002 |
| 701.33871447 | 0.002 |
| 701.50176062 | 0.002 |
| 701.66481241 | 0.002 |
| 701.82786981 | 0.002 |
| 701.99093283 | 0.002 |
| 702.15400147 | 0.002 |
| 702.31707572 | 0.002 |
| 702.48015558 | 0.002 |
| 702.64324105 | 0.002 |
| 702.80633212 | 0.002 |
| 702.96942879 | 0.002 |
| 703.13253106 | 0.002 |
| 703.29563893 | 0.002 |
| 703.45875239 | 0.002 |
| 703.62187143 | 0.002 |
| 703.78499607 | 0.002 |
| 703.94812629 | 0.002 |
| 704.11126209 | 0.002 |
| 704.27440347 | 0.002 |
| 704.43755042 | 0.002 |
| 704.60070295 | 0.002 |
| 704.76386105 | 0.002 |
| 704.92702471 | 0.002 |
| 705.09019394 | 0.002 |
| 705.25336873 | 0.002 |
| 705.41654907 | 0.002 |
| 705.57973497 | 0.002 |
| 705.74292643 | 0.002 |
| 705.90612343 | 0.002 |
| 706.06932599 | 0.002 |
| 706.23253408 | 0.002 |
| 706.39574772 | 0.002 |
| 706.55896689 | 0.002 |
| 706.7221916 | 0.002 |
| 706.88542185 | 0.002 |
| 707.04865762 | 0.002 |
| 707.21189892 | 0.002 |
| 707.37514574 | 0.002 |
| 707.53839809 | 0.002 |
| 707.70165595 | 0.002 |
| 707.86491933 | 0.002 |
| 708.02818822 | 0.002 |
| 708.19146262 | 0.002 |
| 708.35474253 | 0.002 |
| 708.51802794 | 0.002 |
| 708.68131886 | 0.002 |
| 708.84461527 | 0.002 |
| 709.00791717 | 0.002 |
| 709.17122457 | 0.002 |
| 709.33453746 | 0.002 |
| 709.49785584 | 0.002 |
| 709.6611797 | 0.002 |
| 709.82450904 | 0.002 |
| 709.98784386 | 0.002 |
| 710.15118415 | 0.002 |
| 710.31452992 | 0.002 |
| 710.47788116 | 0.002 |
| 710.64123786 | 0.002 |
| 710.80460003 | 0.002 |
| 710.96796766 | 0.002 |
| 711.13134075 | 0.002 |
| 711.29471929 | 0.002 |
| 711.45810329 | 0.002 |
| 711.62149273 | 0.002 |
| 711.78488762 | 0.002 |
| 711.94828796 | 0.002 |
| 712.11169374 | 0.002 |
| 712.27510495 | 0.002 |
| 712.4385216 | 0.002 |
| 712.60194369 | 0.002 |
| 712.7653712 | 0.002 |
| 712.92880414 | 0.002 |
| 713.09224251 | 0.002 |
| 713.25568629 | 0.002 |
| 713.41913549 | 0.002 |
| 713.58259011 | 0.002 |
| 713.74605014 | 0.002 |
| 713.90951559 | 0.002 |
| 714.07298643 | 0.002 |
| 714.23646269 | 0.002 |
| 714.39994434 | 0.002 |
| 714.56343139 | 0.002 |
| 714.72692384 | 0.002 |
| 714.89042168 | 0.002 |
| 715.05392491 | 0.002 |
| 715.21743352 | 0.002 |
| 715.38094752 | 0.002 |
| 715.54446691 | 0.002 |
| 715.70799167 | 0.002 |
| 715.8715218 | 0.002 |
| 716.03505731 | 0.002 |
| 716.19859819 | 0.002 |
| 716.36214443 | 0.002 |
| 716.52569604 | 0.002 |
| 716.68925301 | 0.002 |
| 716.85281534 | 0.002 |
| 717.01638302 | 0.002 |
| 717.17995605 | 0.002 |
| 717.34353444 | 0.002 |
| 717.50711817 | 0.002 |
| 717.67070725 | 0.002 |
| 717.83430166 | 0.002 |
| 717.99790142 | 0.002 |
| 718.16150651 | 0.002 |
| 718.32511694 | 0.002 |
| 718.48873269 | 0.002 |
| 718.65235377 | 0.002 |
| 718.81598017 | 0.002 |
| 718.9796119 | 0.002 |
| 719.14324894 | 0.002 |
| 719.3068913 | 0.002 |
| 719.47053897 | 0.002 |
| 719.63419195 | 0.002 |
| 719.79785024 | 0.002 |
| 719.96151383 | 0.002 |
| 720.12518273 | 0.002 |
| 720.28885692 | 0.002 |
| 720.4525364 | 0.002 |
| 720.61622118 | 0.002 |
| 720.77991125 | 0.002 |
| 720.94360661 | 0.002 |
| 721.10730725 | 0.002 |
| 721.27101317 | 0.002 |
| 721.43472437 | 0.002 |
| 721.59844084 | 0.002 |
| 721.76216259 | 0.002 |
| 721.92588961 | 0.002 |
| 722.08962189 | 0.002 |
| 722.25335944 | 0.002 |
| 722.41710225 | 0.002 |
| 722.58085032 | 0.002 |
| 722.74460364 | 0.002 |
| 722.90836221 | 0.002 |
| 723.07212604 | 0.002 |
| 723.23589511 | 0.002 |
| 723.39966943 | 0.002 |
| 723.56344898 | 0.002 |
| 723.72723378 | 0.002 |
| 723.89102381 | 0.002 |
| 724.05481907 | 0.002 |
| 724.21861956 | 0.002 |
| 724.38242528 | 0.002 |
| 724.54623623 | 0.002 |
| 724.71005239 | 0.002 |
| 724.87387377 | 0.002 |
| 725.03770037 | 0.002 |
| 725.20153218 | 0.002 |
| 725.3653692 | 0.002 |
| 725.52921143 | 0.002 |
| 725.69305886 | 0.002 |
| 725.85691149 | 0.002 |
| 726.02076932 | 0.002 |
| 726.18463235 | 0.002 |
| 726.34850057 | 0.002 |
| 726.51237398 | 0.002 |
| 726.67625257 | 0.002 |
| 726.84013635 | 0.002 |
| 727.00402531 | 0.002 |
| 727.16791945 | 0.002 |
| 727.33181876 | 0.002 |
| 727.49572325 | 0.002 |
| 727.65963291 | 0.002 |
| 727.82354773 | 0.002 |
| 727.98746772 | 0.002 |
| 728.15139286 | 0.002 |
| 728.31532317 | 0.002 |
| 728.47925863 | 0.002 |
| 728.64319925 | 0.002 |
| 728.80714501 | 0.002 |
| 728.97109592 | 0.002 |
| 729.13505197 | 0.002 |
| 729.29901317 | 0.003 |
| 729.4629795 | 0.002 |
| 729.62695097 | 0.002 |
| 729.79092758 | 0.002 |
| 729.95490931 | 0.002 |
| 730.11889616 | 0.002 |
| 730.28288815 | 0.002 |
| 730.44688525 | 0.002 |
| 730.61088747 | 0.002 |
| 730.77489481 | 0.002 |
| 730.93890726 | 0.002 |
| 731.10292482 | 0.002 |
| 731.26694748 | 0.002 |
| 731.43097525 | 0.002 |
| 731.59500812 | 0.002 |
| 731.75904609 | 0.002 |
| 731.92308916 | 0.002 |
| 732.08713732 | 0.002 |
| 732.25119056 | 0.002 |
| 732.4152489 | 0.002 |
| 732.57931231 | 0.002 |
| 732.74338081 | 0.002 |
| 732.90745439 | 0.002 |
| 733.07153304 | 0.002 |
| 733.23561677 | 0.002 |
| 733.39970556 | 0.002 |
| 733.56379942 | 0.002 |
| 733.72789835 | 0.002 |
| 733.89200233 | 0.002 |
| 734.05611138 | 0.002 |
| 734.22022548 | 0.003 |
| 734.38434463 | 0.002 |
| 734.54846883 | 0.003 |
| 734.71259808 | 0.002 |
| 734.87673237 | 0.002 |
| 735.04087171 | 0.002 |
| 735.20501608 | 0.003 |
| 735.36916549 | 0.002 |
| 735.53331993 | 0.003 |
| 735.6974794 | 0.002 |
| 735.86164389 | 0.003 |
| 736.02581342 | 0.002 |
| 736.18998796 | 0.002 |
| 736.35416752 | 0.002 |
| 736.51835209 | 0.002 |
| 736.68254168 | 0.002 |
| 736.84673628 | 0.003 |
| 737.01093588 | 0.002 |
| 737.17514049 | 0.003 |
| 737.3393501 | 0.002 |
| 737.50356471 | 0.003 |
| 737.66778431 | 0.002 |
| 737.8320089 | 0.003 |
| 737.99623849 | 0.002 |
| 738.16047306 | 0.002 |
| 738.32471262 | 0.002 |
| 738.48895715 | 0.002 |
| 738.65320667 | 0.003 |
| 738.81746116 | 0.002 |
| 738.98172062 | 0.003 |
| 739.14598505 | 0.002 |
| 739.31025445 | 0.003 |
| 739.47452881 | 0.002 |
| 739.63880814 | 0.003 |
| 739.80309242 | 0.002 |
| 739.96738166 | 0.002 |
| 740.13167585 | 0.002 |
| 740.29597499 | 0.003 |
| 740.46027908 | 0.002 |
| 740.62458811 | 0.003 |
| 740.78890208 | 0.003 |
| 740.95322099 | 0.003 |
| 741.11754483 | 0.002 |
| 741.28187361 | 0.003 |
| 741.44620732 | 0.002 |
| 741.61054595 | 0.003 |
| 741.77488951 | 0.002 |
| 741.93923799 | 0.003 |
| 742.10359139 | 0.002 |
| 742.2679497 | 0.003 |
| 742.43231293 | 0.003 |
| 742.59668106 | 0.003 |
| 742.7610541 | 0.003 |
| 742.92543205 | 0.003 |
| 743.0898149 | 0.003 |
| 743.25420264 | 0.003 |
| 743.41859528 | 0.003 |
| 743.58299281 | 0.003 |
| 743.74739524 | 0.003 |
| 743.91180254 | 0.003 |
| 744.07621474 | 0.003 |
| 744.24063181 | 0.003 |
| 744.40505376 | 0.003 |
| 744.56948059 | 0.003 |
| 744.73391229 | 0.003 |
| 744.89834886 | 0.003 |
| 745.0627903 | 0.003 |
| 745.2272366 | 0.003 |
| 745.39168776 | 0.003 |
| 745.55614378 | 0.003 |
| 745.72060466 | 0.003 |
| 745.88507038 | 0.003 |
| 746.04954096 | 0.003 |
| 746.21401638 | 0.003 |
| 746.37849665 | 0.003 |
| 746.54298176 | 0.003 |
| 746.70747171 | 0.003 |
| 746.87196649 | 0.003 |
| 747.03646611 | 0.003 |
| 747.20097055 | 0.003 |
| 747.36547982 | 0.003 |
| 747.52999392 | 0.003 |
| 747.69451283 | 0.003 |
| 747.85903657 | 0.003 |
| 748.02356512 | 0.003 |
| 748.18809848 | 0.003 |
| 748.35263665 | 0.003 |
| 748.51717963 | 0.003 |
| 748.68172741 | 0.003 |
| 748.84628 | 0.003 |
| 749.01083738 | 0.003 |
| 749.17539956 | 0.003 |
| 749.33996652 | 0.003 |
| 749.50453828 | 0.003 |
| 749.66911483 | 0.003 |
| 749.83369616 | 0.003 |
| 749.99828227 | 0.003 |
| 750.16287316 | 0.003 |
| 750.32746882 | 0.003 |
| 750.49206926 | 0.003 |
| 750.65667447 | 0.003 |
| 750.82128444 | 0.003 |
| 750.98589918 | 0.003 |
| 751.15051868 | 0.003 |
| 751.31514293 | 0.003 |
| 751.47977195 | 0.003 |
| 751.64440571 | 0.003 |
| 751.80904422 | 0.003 |
| 751.97368748 | 0.003 |
| 752.13833549 | 0.003 |
| 752.30298823 | 0.003 |
| 752.46764572 | 0.003 |
| 752.63230794 | 0.003 |
| 752.79697489 | 0.003 |
| 752.96164657 | 0.003 |
| 753.12632298 | 0.003 |
| 753.29100411 | 0.003 |
| 753.45568996 | 0.003 |
| 753.62038053 | 0.003 |
| 753.78507582 | 0.003 |
| 753.94977582 | 0.003 |
| 754.11448053 | 0.003 |
| 754.27918994 | 0.003 |
| 754.44390406 | 0.003 |
| 754.60862288 | 0.003 |
| 754.7733464 | 0.003 |
| 754.93807461 | 0.003 |
| 755.10280752 | 0.003 |
| 755.26754512 | 0.003 |
| 755.4322874 | 0.003 |
| 755.59703436 | 0.003 |
| 755.76178601 | 0.003 |
| 755.92654234 | 0.003 |
| 756.09130334 | 0.003 |
| 756.25606901 | 0.003 |
| 756.42083935 | 0.003 |
| 756.58561436 | 0.003 |
| 756.75039404 | 0.003 |
| 756.91517837 | 0.003 |
| 757.07996736 | 0.003 |
| 757.24476101 | 0.003 |
| 757.40955931 | 0.003 |
| 757.57436226 | 0.003 |
| 757.73916986 | 0.003 |
| 757.9039821 | 0.003 |
| 758.06879898 | 0.003 |
| 758.2336205 | 0.003 |
| 758.39844666 | 0.003 |
| 758.56327744 | 0.003 |
| 758.72811286 | 0.003 |
| 758.89295291 | 0.003 |
| 759.05779757 | 0.003 |
| 759.22264686 | 0.003 |
| 759.38750077 | 0.003 |
| 759.55235929 | 0.003 |
| 759.71722243 | 0.003 |
| 759.88209017 | 0.003 |
| 760.04696252 | 0.003 |
| 760.21183948 | 0.003 |
| 760.37672103 | 0.003 |
| 760.54160719 | 0.003 |
| 760.70649794 | 0.003 |
| 760.87139328 | 0.003 |
| 761.03629321 | 0.003 |
| 761.20119773 | 0.003 |
| 761.36610683 | 0.003 |
| 761.53102051 | 0.003 |
| 761.69593877 | 0.003 |
| 761.86086161 | 0.003 |
| 762.02578902 | 0.003 |
| 762.190721 | 0.003 |
| 762.35565754 | 0.004 |
| 762.52059865 | 0.003 |
| 762.68554432 | 0.004 |
| 762.85049455 | 0.003 |
| 763.01544934 | 0.004 |
| 763.18040867 | 0.003 |
| 763.34537256 | 0.003 |
| 763.51034099 | 0.003 |
| 763.67531397 | 0.004 |
| 763.84029148 | 0.003 |
| 764.00527354 | 0.004 |
| 764.17026013 | 0.003 |
| 764.33525125 | 0.004 |
| 764.5002469 | 0.003 |
| 764.66524708 | 0.004 |
| 764.83025179 | 0.003 |
| 764.99526101 | 0.004 |
| 765.16027475 | 0.003 |
| 765.32529301 | 0.004 |
| 765.49031578 | 0.004 |
| 765.65534306 | 0.004 |
| 765.82037485 | 0.004 |
| 765.98541114 | 0.004 |
| 766.15045193 | 0.003 |
| 766.31549722 | 0.004 |
| 766.480547 | 0.004 |
| 766.64560128 | 0.004 |
| 766.81066005 | 0.004 |
| 766.9757233 | 0.004 |
| 767.14079104 | 0.004 |
| 767.30586326 | 0.004 |
| 767.47093995 | 0.004 |
| 767.63602113 | 0.004 |
| 767.80110677 | 0.004 |
| 767.96619688 | 0.004 |
| 768.13129146 | 0.004 |
| 768.29639051 | 0.004 |
| 768.46149401 | 0.004 |
| 768.62660198 | 0.004 |
| 768.7917144 | 0.004 |
| 768.95683127 | 0.004 |
| 769.12195259 | 0.004 |
| 769.28707835 | 0.004 |
| 769.45220857 | 0.004 |
| 769.61734322 | 0.004 |
| 769.78248231 | 0.004 |
| 769.94762583 | 0.004 |
| 770.11277379 | 0.004 |
| 770.27792618 | 0.004 |
| 770.44308299 | 0.004 |
| 770.60824423 | 0.004 |
| 770.77340989 | 0.004 |
| 770.93857997 | 0.004 |
| 771.10375446 | 0.004 |
| 771.26893337 | 0.004 |
| 771.43411668 | 0.004 |
| 771.5993044 | 0.004 |
| 771.76449653 | 0.004 |
| 771.92969305 | 0.004 |
| 772.09489398 | 0.004 |
| 772.2600993 | 0.004 |
| 772.42530901 | 0.004 |
| 772.59052311 | 0.005 |
| 772.7557416 | 0.004 |
| 772.92096447 | 0.005 |
| 773.08619172 | 0.004 |
| 773.25142335 | 0.005 |
| 773.41665936 | 0.004 |
| 773.58189974 | 0.005 |
| 773.74714449 | 0.004 |
| 773.9123936 | 0.005 |
| 774.07764708 | 0.004 |
| 774.24290492 | 0.005 |
| 774.40816712 | 0.004 |
| 774.57343367 | 0.005 |
| 774.73870458 | 0.004 |
| 774.90397983 | 0.005 |
| 775.06925944 | 0.005 |
| 775.23454338 | 0.005 |
| 775.39983167 | 0.005 |
| 775.56512429 | 0.005 |
| 775.73042125 | 0.005 |
| 775.89572255 | 0.005 |
| 776.06102817 | 0.005 |
| 776.22633812 | 0.005 |
| 776.39165239 | 0.005 |
| 776.55697098 | 0.005 |
| 776.72229389 | 0.005 |
| 776.88762112 | 0.005 |
| 777.05295266 | 0.005 |
| 777.21828851 | 0.005 |
| 777.38362866 | 0.005 |
| 777.54897312 | 0.005 |
| 777.71432188 | 0.005 |
| 777.87967494 | 0.005 |
| 778.0450323 | 0.005 |
| 778.21039394 | 0.006 |
| 778.37575988 | 0.005 |
| 778.5411301 | 0.006 |
| 778.70650461 | 0.005 |
| 778.87188339 | 0.006 |
| 779.03726646 | 0.006 |
| 779.2026538 | 0.006 |
| 779.36804541 | 0.006 |
| 779.53344129 | 0.006 |
| 779.69884144 | 0.006 |
| 779.86424586 | 0.006 |
| 780.02965453 | 0.006 |
| 780.19506746 | 0.006 |
| 780.36048465 | 0.006 |
| 780.52590609 | 0.006 |
| 780.69133178 | 0.006 |
| 780.85676171 | 0.006 |
| 781.02219589 | 0.006 |
| 781.18763431 | 0.006 |
| 781.35307697 | 0.007 |
| 781.51852387 | 0.006 |
| 781.68397499 | 0.007 |
| 781.84943035 | 0.006 |
| 782.01488993 | 0.007 |
| 782.18035374 | 0.007 |
| 782.34582176 | 0.007 |
| 782.51129401 | 0.007 |
| 782.67677047 | 0.007 |
| 782.84225114 | 0.007 |
| 783.00773602 | 0.007 |
| 783.17322511 | 0.007 |
| 783.33871841 | 0.007 |
| 783.5042159 | 0.007 |
| 783.66971759 | 0.007 |
| 783.83522348 | 0.007 |
| 784.00073356 | 0.007 |
| 784.16624783 | 0.007 |
| 784.33176629 | 0.008 |
| 784.49728892 | 0.008 |
| 784.66281575 | 0.008 |
| 784.82834674 | 0.008 |
| 784.99388192 | 0.008 |
| 785.15942126 | 0.008 |
| 785.32496478 | 0.009 |
| 785.49051246 | 0.008 |
| 785.65606431 | 0.009 |
| 785.82162032 | 0.008 |
| 785.98718048 | 0.009 |
| 786.1527448 | 0.008 |
| 786.31831328 | 0.009 |
| 786.4838859 | 0.009 |
| 786.64946267 | 0.009 |
| 786.81504358 | 0.009 |
| 786.98062863 | 0.01 |
| 787.14621783 | 0.01 |
| 787.31181115 | 0.01 |
| 787.47740861 | 0.01 |
| 787.6430102 | 0.01 |
| 787.80861592 | 0.01 |
| 787.97422576 | 0.011 |
| 788.13983972 | 0.011 |
| 788.3054578 | 0.011 |
| 788.47107999 | 0.011 |
| 788.6367063 | 0.011 |
| 788.80233671 | 0.011 |
| 788.96797123 | 0.012 |
| 789.13360986 | 0.012 |
| 789.29925259 | 0.012 |
| 789.46489941 | 0.012 |
| 789.63055033 | 0.012 |
| 789.79620534 | 0.012 |
| 789.96186445 | 0.012 |
| 790.12752764 | 0.012 |
| 790.29319491 | 0.013 |
| 790.45886626 | 0.013 |
| 790.62454169 | 0.013 |
| 790.7902212 | 0.013 |
| 790.95590478 | 0.013 |
| 791.12159243 | 0.013 |
| 791.28728414 | 0.013 |
| 791.45297992 | 0.013 |
| 791.61867976 | 0.014 |
| 791.78438366 | 0.014 |
| 791.95009162 | 0.014 |
| 792.11580362 | 0.014 |
| 792.28151968 | 0.014 |
| 792.44723978 | 0.014 |
| 792.61296392 | 0.014 |
| 792.77869211 | 0.014 |
| 792.94442434 | 0.014 |
| 793.1101606 | 0.015 |
| 793.27590089 | 0.014 |
| 793.44164521 | 0.015 |
| 793.60739356 | 0.015 |
| 793.77314593 | 0.015 |
| 793.93890232 | 0.015 |
| 794.10466273 | 0.015 |
| 794.27042716 | 0.015 |
| 794.4361956 | 0.015 |
| 794.60196805 | 0.015 |
| 794.7677445 | 0.015 |
| 794.93352496 | 0.015 |
| 795.09930942 | 0.015 |
| 795.26509788 | 0.015 |
| 795.43089033 | 0.015 |
| 795.59668678 | 0.015 |
| 795.76248721 | 0.015 |
| 795.92829163 | 0.015 |
| 796.09410004 | 0.015 |
| 796.25991242 | 0.015 |
| 796.42572879 | 0.015 |
| 796.59154913 | 0.015 |
| 796.75737344 | 0.015 |
| 796.92320172 | 0.015 |
| 797.08903397 | 0.015 |
| 797.25487018 | 0.014 |
| 797.42071035 | 0.015 |
| 797.58655448 | 0.014 |
| 797.75240257 | 0.015 |
| 797.91825461 | 0.014 |
| 798.08411059 | 0.015 |
| 798.24997053 | 0.014 |
| 798.41583441 | 0.015 |
| 798.58170222 | 0.014 |
| 798.74757398 | 0.015 |
| 798.91344967 | 0.014 |
| 799.0793293 | 0.015 |
| 799.24521285 | 0.014 |
| 799.41110033 | 0.015 |
| 799.57699174 | 0.014 |
| 799.74288706 | 0.015 |
| 799.90878631 | 0.014 |
| 800.07468946 | 0.015 |
| 800.24059653 | 0.014 |
| 800.40650752 | 0.015 |
| 800.5724224 | 0.014 |
| 800.73834119 | 0.015 |
| 800.90426388 | 0.014 |
| 801.07019047 | 0.015 |
| 801.23612096 | 0.014 |
| 801.40205534 | 0.015 |
| 801.5679936 | 0.015 |
| 801.73393576 | 0.016 |
| 801.89988179 | 0.015 |
| 802.06583171 | 0.016 |
| 802.23178551 | 0.015 |
| 802.39774318 | 0.016 |
| 802.56370472 | 0.016 |
| 802.72967013 | 0.016 |
| 802.89563941 | 0.016 |
| 803.06161256 | 0.016 |
| 803.22758956 | 0.016 |
| 803.39357042 | 0.016 |
| 803.55955514 | 0.016 |
| 803.72554371 | 0.016 |
| 803.89153613 | 0.016 |
| 804.0575324 | 0.016 |
| 804.22353251 | 0.016 |
| 804.38953646 | 0.016 |
| 804.55554424 | 0.016 |
| 804.72155587 | 0.016 |
| 804.88757132 | 0.016 |
| 805.05359061 | 0.016 |
| 805.21961372 | 0.016 |
| 805.38564066 | 0.015 |
| 805.55167141 | 0.016 |
| 805.71770599 | 0.015 |
| 805.88374438 | 0.016 |
| 806.04978658 | 0.015 |
| 806.21583259 | 0.015 |
| 806.38188241 | 0.014 |
| 806.54793603 | 0.015 |
| 806.71399346 | 0.014 |
| 806.88005468 | 0.014 |
| 807.04611969 | 0.014 |
| 807.2121885 | 0.014 |
| 807.3782611 | 0.014 |
| 807.54433749 | 0.014 |
| 807.71041765 | 0.014 |
| 807.8765016 | 0.014 |
| 808.04258933 | 0.014 |
| 808.20868083 | 0.015 |
| 808.37477611 | 0.015 |
| 808.54087515 | 0.015 |
| 808.70697796 | 0.015 |
| 808.87308454 | 0.016 |
| 809.03919487 | 0.016 |
| 809.20530897 | 0.017 |
| 809.37142682 | 0.017 |
| 809.53754842 | 0.018 |
| 809.70367377 | 0.017 |
| 809.86980286 | 0.019 |
| 810.0359357 | 0.019 |
| 810.20207229 | 0.021 |
| 810.36821261 | 0.021 |
| 810.53435666 | 0.023 |
| 810.70050445 | 0.022 |
| 810.86665596 | 0.024 |
| 811.03281121 | 0.023 |
| 811.19897017 | 0.025 |
| 811.36513286 | 0.024 |
| 811.53129927 | 0.026 |
| 811.69746939 | 0.025 |
| 811.86364322 | 0.027 |
| 812.02982076 | 0.026 |
| 812.19600201 | 0.028 |
| 812.36218697 | 0.027 |
| 812.52837562 | 0.028 |
| 812.69456797 | 0.027 |
| 812.86076402 | 0.028 |
| 813.02696376 | 0.027 |
| 813.19316719 | 0.028 |
| 813.3593743 | 0.027 |
| 813.5255851 | 0.028 |
| 813.69179958 | 0.027 |
| 813.85801774 | 0.028 |
| 814.02423957 | 0.027 |
| 814.19046508 | 0.027 |
| 814.35669425 | 0.027 |
| 814.5229271 | 0.027 |
| 814.6891636 | 0.027 |
| 814.85540377 | 0.027 |
| 815.02164759 | 0.028 |
| 815.18789507 | 0.028 |
| 815.3541462 | 0.028 |
| 815.52040098 | 0.028 |
| 815.68665941 | 0.03 |
| 815.85292148 | 0.029 |
| 816.01918719 | 0.03 |
| 816.18545654 | 0.029 |
| 816.35172953 | 0.031 |
| 816.51800615 | 0.03 |
| 816.68428639 | 0.033 |
| 816.85057027 | 0.032 |
| 817.01685777 | 0.034 |
| 817.18314888 | 0.033 |
| 817.34944362 | 0.034 |
| 817.51574197 | 0.033 |
| 817.68204393 | 0.035 |
| 817.84834951 | 0.034 |
| 818.01465869 | 0.035 |
| 818.18097147 | 0.035 |
| 818.34728785 | 0.035 |
| 818.51360784 | 0.035 |
| 818.67993141 | 0.035 |
| 818.84625858 | 0.035 |
| 819.01258934 | 0.035 |
| 819.17892369 | 0.034 |
| 819.34526162 | 0.034 |
| 819.51160313 | 0.034 |
| 819.67794822 | 0.034 |
| 819.84429688 | 0.034 |
| 820.01064912 | 0.034 |
| 820.17700492 | 0.034 |
| 820.34336429 | 0.033 |
| 820.50972723 | 0.033 |
| 820.67609372 | 0.033 |
| 820.84246378 | 0.033 |
| 821.00883739 | 0.033 |
| 821.17521455 | 0.033 |
| 821.34159526 | 0.033 |
| 821.50797952 | 0.033 |
| 821.67436732 | 0.033 |
| 821.84075866 | 0.033 |
| 822.00715354 | 0.033 |
| 822.17355196 | 0.033 |
| 822.3399539 | 0.033 |
| 822.50635938 | 0.033 |
| 822.67276838 | 0.033 |
| 822.83918091 | 0.033 |
| 823.00559696 | 0.034 |
| 823.17201653 | 0.034 |
| 823.33843961 | 0.035 |
| 823.5048662 | 0.035 |
| 823.6712963 | 0.036 |
| 823.83772991 | 0.035 |
| 824.00416703 | 0.036 |
| 824.17060764 | 0.036 |
| 824.33705175 | 0.037 |
| 824.50349936 | 0.036 |
| 824.66995046 | 0.037 |
| 824.83640505 | 0.036 |
| 825.00286312 | 0.037 |
| 825.16932468 | 0.037 |
| 825.33578972 | 0.038 |
| 825.50225824 | 0.038 |
| 825.66873023 | 0.038 |
| 825.8352057 | 0.038 |
| 826.00168463 | 0.039 |
| 826.16816703 | 0.039 |
| 826.3346529 | 0.04 |
| 826.50114222 | 0.04 |
| 826.66763501 | 0.04 |
| 826.83413125 | 0.041 |
| 827.00063094 | 0.041 |
| 827.16713408 | 0.041 |
| 827.33364067 | 0.042 |
| 827.5001507 | 0.042 |
| 827.66666417 | 0.042 |
| 827.83318108 | 0.043 |
| 827.99970142 | 0.043 |
| 828.1662252 | 0.044 |
| 828.33275241 | 0.044 |
| 828.49928304 | 0.044 |
| 828.6658171 | 0.045 |
| 828.83235457 | 0.046 |
| 828.99889547 | 0.046 |
| 829.16543978 | 0.047 |
| 829.3319875 | 0.048 |
| 829.49853863 | 0.048 |
| 829.66509317 | 0.048 |
| 829.83165111 | 0.048 |
| 829.99821246 | 0.048 |
| 830.1647772 | 0.049 |
| 830.33134534 | 0.049 |
| 830.49791686 | 0.05 |
| 830.66449178 | 0.05 |
| 830.83107009 | 0.05 |
| 830.99765177 | 0.05 |
| 831.16423684 | 0.05 |
| 831.33082529 | 0.05 |
| 831.49741711 | 0.05 |
| 831.66401231 | 0.051 |
| 831.83061087 | 0.051 |
| 831.9972128 | 0.051 |
| 832.16381809 | 0.052 |
| 832.33042675 | 0.052 |
| 832.49703876 | 0.052 |
| 832.66365413 | 0.052 |
| 832.83027285 | 0.053 |
| 832.99689492 | 0.053 |
| 833.16352034 | 0.053 |
| 833.3301491 | 0.054 |
| 833.4967812 | 0.053 |
| 833.66341663 | 0.054 |
| 833.83005541 | 0.053 |
| 833.99669751 | 0.054 |
| 834.16334295 | 0.054 |
| 834.32999171 | 0.054 |
| 834.4966438 | 0.054 |
| 834.6632992 | 0.055 |
| 834.82995793 | 0.055 |
| 834.99661997 | 0.055 |
| 835.16328532 | 0.055 |
| 835.32995398 | 0.056 |
| 835.49662594 | 0.056 |
| 835.66330122 | 0.056 |
| 835.82997979 | 0.056 |
| 835.99666166 | 0.056 |
| 836.16334682 | 0.056 |
| 836.33003528 | 0.057 |
| 836.49672703 | 0.057 |
| 836.66342206 | 0.057 |
| 836.83012038 | 0.057 |
| 836.99682197 | 0.058 |
| 837.16352685 | 0.058 |
| 837.330235 | 0.059 |
| 837.49694642 | 0.059 |
| 837.66366111 | 0.059 |
| 837.83037907 | 0.059 |
| 837.9971003 | 0.06 |
| 838.16382478 | 0.06 |
| 838.33055252 | 0.06 |
| 838.49728352 | 0.061 |
| 838.66401776 | 0.061 |
| 838.83075526 | 0.061 |
| 838.99749601 | 0.062 |
| 839.16424 | 0.062 |
| 839.33098722 | 0.063 |
| 839.49773769 | 0.063 |
| 839.66449139 | 0.064 |
| 839.83124833 | 0.064 |
| 839.99800849 | 0.064 |
| 840.16477188 | 0.064 |
| 840.33153849 | 0.064 |
| 840.49830833 | 0.064 |
| 840.66508138 | 0.065 |
| 840.83185765 | 0.065 |
| 840.99863713 | 0.065 |
| 841.16541982 | 0.065 |
| 841.33220571 | 0.066 |
| 841.49899481 | 0.066 |
| 841.66578711 | 0.066 |
| 841.83258261 | 0.066 |
| 841.9993813 | 0.067 |
| 842.16618319 | 0.067 |
| 842.33298826 | 0.067 |
| 842.49979652 | 0.068 |
| 842.66660797 | 0.068 |
| 842.83342259 | 0.069 |
| 843.0002404 | 0.07 |
| 843.16706138 | 0.07 |
| 843.33388553 | 0.07 |
| 843.50071285 | 0.071 |
| 843.66754333 | 0.071 |
| 843.83437698 | 0.071 |
| 844.00121379 | 0.071 |
| 844.16805376 | 0.071 |
| 844.33489689 | 0.072 |
| 844.50174316 | 0.072 |
| 844.66859259 | 0.072 |
| 844.83544516 | 0.073 |
| 845.00230088 | 0.073 |
| 845.16915973 | 0.073 |
| 845.33602173 | 0.074 |
| 845.50288686 | 0.074 |
| 845.66975512 | 0.074 |
| 845.83662651 | 0.075 |
| 846.00350103 | 0.075 |
| 846.17037867 | 0.076 |
| 846.33725943 | 0.076 |
| 846.50414331 | 0.076 |
| 846.67103031 | 0.077 |
| 846.83792041 | 0.078 |
| 847.00481363 | 0.078 |
| 847.17170995 | 0.079 |
| 847.33860938 | 0.079 |
| 847.50551191 | 0.079 |
| 847.67241753 | 0.08 |
| 847.83932625 | 0.08 |
| 848.00623807 | 0.081 |
| 848.17315297 | 0.081 |
| 848.34007096 | 0.081 |
| 848.50699203 | 0.081 |
| 848.67391618 | 0.082 |
| 848.84084341 | 0.082 |
| 849.00777372 | 0.083 |
| 849.1747071 | 0.084 |
| 849.34164354 | 0.084 |
| 849.50858306 | 0.085 |
| 849.67552564 | 0.085 |
| 849.84247127 | 0.086 |
| 850.00941997 | 0.086 |
| 850.17637172 | 0.087 |
| 850.34332653 | 0.087 |
| 850.51028438 | 0.087 |
| 850.67724528 | 0.088 |
| 850.84420922 | 0.088 |
| 851.0111762 | 0.089 |
| 851.17814623 | 0.089 |
| 851.34511928 | 0.089 |
| 851.51209537 | 0.089 |
| 851.67907449 | 0.09 |
| 851.84605664 | 0.091 |
| 852.0130418 | 0.091 |
| 852.18002999 | 0.091 |
| 852.3470212 | 0.091 |
| 852.51401542 | 0.091 |
| 852.68101266 | 0.092 |
| 852.8480129 | 0.092 |
| 853.01501615 | 0.093 |
| 853.1820224 | 0.093 |
| 853.34903166 | 0.094 |
| 853.51604391 | 0.095 |
| 853.68305916 | 0.096 |
| 853.8500774 | 0.096 |
| 854.01709863 | 0.097 |
| 854.18412284 | 0.097 |
| 854.35115004 | 0.097 |
| 854.51818022 | 0.098 |
| 854.68521338 | 0.099 |
| 854.85224951 | 0.1 |
| 855.01928862 | 0.101 |
| 855.18633069 | 0.101 |
| 855.35337573 | 0.102 |
| 855.52042374 | 0.102 |
| 855.6874747 | 0.102 |
| 855.85452862 | 0.102 |
| 856.0215855 | 0.102 |
| 856.18864533 | 0.103 |
| 856.35570811 | 0.104 |
| 856.52277384 | 0.104 |
| 856.68984251 | 0.105 |
| 856.85691412 | 0.105 |
| 857.02398867 | 0.106 |
| 857.19106615 | 0.106 |
| 857.35814657 | 0.107 |
| 857.52522991 | 0.107 |
| 857.69231618 | 0.108 |
| 857.85940538 | 0.108 |
| 858.02649749 | 0.109 |
| 858.19359253 | 0.11 |
| 858.36069048 | 0.111 |
| 858.52779134 | 0.111 |
| 858.69489511 | 0.111 |
| 858.86200178 | 0.112 |
| 859.02911136 | 0.113 |
| 859.19622384 | 0.113 |
| 859.36333922 | 0.114 |
| 859.5304575 | 0.114 |
| 859.69757866 | 0.115 |
| 859.86470272 | 0.116 |
| 860.03182966 | 0.117 |
| 860.19895949 | 0.117 |
| 860.36609219 | 0.118 |
| 860.53322778 | 0.118 |
| 860.70036623 | 0.119 |
| 860.86750757 | 0.12 |
| 861.03465177 | 0.121 |
| 861.20179883 | 0.122 |
| 861.36894876 | 0.123 |
| 861.53610156 | 0.124 |
| 861.7032572 | 0.124 |
| 861.87041571 | 0.125 |
| 862.03757707 | 0.126 |
| 862.20474127 | 0.126 |
| 862.37190832 | 0.127 |
| 862.53907822 | 0.128 |
| 862.70625096 | 0.129 |
| 862.87342653 | 0.13 |
| 863.04060494 | 0.13 |
| 863.20778618 | 0.131 |
| 863.37497025 | 0.132 |
| 863.54215715 | 0.132 |
| 863.70934687 | 0.132 |
| 863.87653941 | 0.132 |
| 864.04373477 | 0.133 |
| 864.21093295 | 0.133 |
| 864.37813393 | 0.134 |
| 864.54533773 | 0.134 |
| 864.71254433 | 0.136 |
| 864.87975374 | 0.137 |
| 865.04696594 | 0.139 |
| 865.21418095 | 0.14 |
| 865.38139875 | 0.141 |
| 865.54861934 | 0.142 |
| 865.71584272 | 0.143 |
| 865.88306889 | 0.144 |
| 866.05029784 | 0.145 |
| 866.21752957 | 0.145 |
| 866.38476408 | 0.145 |
| 866.55200137 | 0.146 |
| 866.71924142 | 0.147 |
| 866.88648425 | 0.148 |
| 867.05372984 | 0.148 |
| 867.2209782 | 0.149 |
| 867.38822932 | 0.149 |
| 867.55548319 | 0.15 |
| 867.72273982 | 0.151 |
| 867.8899992 | 0.151 |
| 868.05726134 | 0.151 |
| 868.22452621 | 0.152 |
| 868.39179383 | 0.153 |
| 868.5590642 | 0.155 |
| 868.7263373 | 0.157 |
| 868.89361313 | 0.158 |
| 869.0608917 | 0.159 |
| 869.22817299 | 0.16 |
| 869.39545702 | 0.161 |
| 869.56274376 | 0.163 |
| 869.73003323 | 0.163 |
| 869.89732542 | 0.165 |
| 870.06462032 | 0.166 |
| 870.23191793 | 0.168 |
| 870.39921825 | 0.168 |
| 870.56652128 | 0.168 |
| 870.73382701 | 0.168 |
| 870.90113544 | 0.169 |
| 871.06844657 | 0.17 |
| 871.2357604 | 0.171 |
| 871.40307691 | 0.172 |
| 871.57039612 | 0.173 |
| 871.73771801 | 0.175 |
| 871.90504259 | 0.176 |
| 872.07236985 | 0.178 |
| 872.23969978 | 0.179 |
| 872.40703239 | 0.18 |
| 872.57436767 | 0.181 |
| 872.74170563 | 0.182 |
| 872.90904624 | 0.183 |
| 873.07638952 | 0.184 |
| 873.24373547 | 0.185 |
| 873.41108407 | 0.186 |
| 873.57843532 | 0.187 |
| 873.74578923 | 0.188 |
| 873.91314579 | 0.19 |
| 874.08050499 | 0.191 |
| 874.24786683 | 0.193 |
| 874.41523132 | 0.193 |
| 874.58259845 | 0.194 |
| 874.74996821 | 0.195 |
| 874.9173406 | 0.195 |
| 875.08471562 | 0.195 |
| 875.25209327 | 0.197 |
| 875.41947354 | 0.198 |
| 875.58685643 | 0.199 |
| 875.75424194 | 0.2 |
| 875.92163007 | 0.201 |
| 876.0890208 | 0.201 |
| 876.25641415 | 0.202 |
| 876.4238101 | 0.203 |
| 876.59120866 | 0.204 |
| 876.75860981 | 0.206 |
| 876.92601357 | 0.207 |
| 877.09341992 | 0.209 |
| 877.26082886 | 0.209 |
| 877.42824039 | 0.21 |
| 877.59565451 | 0.211 |
| 877.76307121 | 0.212 |
| 877.93049049 | 0.214 |
| 878.09791235 | 0.215 |
| 878.26533679 | 0.217 |
| 878.43276379 | 0.218 |
| 878.60019337 | 0.219 |
| 878.76762551 | 0.22 |
| 878.93506022 | 0.222 |
| 879.10249748 | 0.224 |
| 879.26993731 | 0.225 |
| 879.43737969 | 0.226 |
| 879.60482462 | 0.227 |
| 879.7722721 | 0.227 |
| 879.93972213 | 0.228 |
| 880.1071747 | 0.229 |
| 880.27462981 | 0.23 |
| 880.44208746 | 0.231 |
| 880.60954764 | 0.232 |
| 880.77701036 | 0.233 |
| 880.94447561 | 0.234 |
| 881.11194338 | 0.236 |
| 881.27941367 | 0.238 |
| 881.44688649 | 0.239 |
| 881.61436183 | 0.24 |
| 881.78183967 | 0.241 |
| 881.94932004 | 0.242 |
| 882.11680291 | 0.243 |
| 882.28428828 | 0.245 |
| 882.45177616 | 0.247 |
| 882.61926654 | 0.25 |
| 882.78675942 | 0.252 |
| 882.9542548 | 0.254 |
| 883.12175266 | 0.255 |
| 883.28925302 | 0.256 |
| 883.45675586 | 0.257 |
| 883.62426119 | 0.258 |
| 883.79176899 | 0.259 |
| 883.95927928 | 0.261 |
| 884.12679203 | 0.262 |
| 884.29430726 | 0.264 |
| 884.46182496 | 0.265 |
| 884.62934513 | 0.268 |
| 884.79686776 | 0.269 |
| 884.96439285 | 0.27 |
| 885.1319204 | 0.27 |
| 885.2994504 | 0.272 |
| 885.46698286 | 0.272 |
| 885.63451776 | 0.274 |
| 885.80205512 | 0.275 |
| 885.96959491 | 0.276 |
| 886.13713715 | 0.278 |
| 886.30468182 | 0.28 |
| 886.47222893 | 0.282 |
| 886.63977847 | 0.283 |
| 886.80733044 | 0.285 |
| 886.97488483 | 0.287 |
| 887.14244165 | 0.29 |
| 887.31000089 | 0.292 |
| 887.47756255 | 0.293 |
| 887.64512662 | 0.295 |
| 887.81269311 | 0.296 |
| 887.980262 | 0.297 |
| 888.1478333 | 0.298 |
| 888.31540701 | 0.3 |
| 888.48298311 | 0.301 |
| 888.65056161 | 0.304 |
| 888.81814251 | 0.306 |
| 888.9857258 | 0.309 |
| 889.15331148 | 0.312 |
| 889.32089955 | 0.315 |
| 889.48848999 | 0.317 |
| 889.65608282 | 0.32 |
| 889.82367803 | 0.32 |
| 889.99127561 | 0.321 |
| 890.15887557 | 0.321 |
| 890.32647789 | 0.322 |
| 890.49408258 | 0.322 |
| 890.66168964 | 0.323 |
| 890.82929905 | 0.324 |
| 890.99691082 | 0.326 |
| 891.16452495 | 0.328 |
| 891.33214143 | 0.331 |
| 891.49976026 | 0.334 |
| 891.66738143 | 0.338 |
| 891.83500495 | 0.34 |
| 892.00263081 | 0.343 |
| 892.170259 | 0.345 |
| 892.33788953 | 0.347 |
| 892.5055224 | 0.348 |
| 892.67315759 | 0.35 |
| 892.84079511 | 0.351 |
| 893.00843495 | 0.353 |
| 893.17607712 | 0.354 |
| 893.3437216 | 0.357 |
| 893.51136839 | 0.359 |
| 893.6790175 | 0.362 |
| 893.84666892 | 0.364 |
| 894.01432264 | 0.367 |
| 894.18197867 | 0.368 |
| 894.349637 | 0.37 |
| 894.51729762 | 0.373 |
| 894.68496054 | 0.376 |
| 894.85262576 | 0.376 |
| 895.02029326 | 0.377 |
| 895.18796305 | 0.377 |
| 895.35563512 | 0.378 |
| 895.52330947 | 0.379 |
| 895.6909861 | 0.382 |
| 895.85866501 | 0.384 |
| 896.02634618 | 0.387 |
| 896.19402963 | 0.389 |
| 896.36171534 | 0.391 |
| 896.52940332 | 0.394 |
| 896.69709356 | 0.397 |
| 896.86478605 | 0.4 |
| 897.0324808 | 0.403 |
| 897.2001778 | 0.405 |
| 897.36787705 | 0.407 |
| 897.53557855 | 0.408 |
| 897.70328229 | 0.411 |
| 897.87098827 | 0.412 |
| 898.03869649 | 0.415 |
| 898.20640695 | 0.417 |
| 898.37411963 | 0.421 |
| 898.54183455 | 0.424 |
| 898.70955169 | 0.428 |
| 898.87727106 | 0.431 |
| 899.04499264 | 0.434 |
| 899.21271645 | 0.436 |
| 899.38044246 | 0.438 |
| 899.5481707 | 0.44 |
| 899.71590114 | 0.443 |
| 899.88363378 | 0.444 |
| 900.05136863 | 0.446 |
| 900.21910568 | 0.448 |
| 900.38684493 | 0.451 |
| 900.55458637 | 0.454 |
| 900.72233001 | 0.458 |
| 900.89007583 | 0.461 |
| 901.05782384 | 0.464 |
| 901.22557404 | 0.465 |
| 901.39332641 | 0.467 |
| 901.56108097 | 0.468 |
| 901.72883769 | 0.471 |
| 901.89659659 | 0.472 |
| 902.06435766 | 0.473 |
| 902.2321209 | 0.474 |
| 902.3998863 | 0.476 |
| 902.56765385 | 0.479 |
| 902.73542357 | 0.481 |
| 902.90319544 | 0.483 |
| 903.07096947 | 0.486 |
| 903.23874564 | 0.488 |
| 903.40652396 | 0.49 |
| 903.57430442 | 0.491 |
| 903.74208703 | 0.494 |
| 903.90987177 | 0.497 |
| 904.07765865 | 0.501 |
| 904.24544765 | 0.505 |
| 904.41323879 | 0.509 |
| 904.58103206 | 0.513 |
| 904.74882744 | 0.516 |
| 904.91662495 | 0.517 |
| 905.08442458 | 0.518 |
| 905.25222632 | 0.519 |
| 905.42003017 | 0.521 |
| 905.58783613 | 0.523 |
| 905.7556442 | 0.526 |
| 905.92345437 | 0.528 |
| 906.09126665 | 0.532 |
| 906.25908102 | 0.536 |
| 906.42689748 | 0.539 |
| 906.59471604 | 0.54 |
| 906.76253668 | 0.541 |
| 906.93035942 | 0.541 |
| 907.09818423 | 0.543 |
| 907.26601113 | 0.544 |
| 907.4338401 | 0.547 |
| 907.60167115 | 0.549 |
| 907.76950428 | 0.553 |
| 907.93733947 | 0.558 |
| 908.10517672 | 0.563 |
| 908.27301604 | 0.567 |
| 908.44085742 | 0.572 |
| 908.60870086 | 0.577 |
| 908.77654636 | 0.581 |
| 908.9443939 | 0.586 |
| 909.1122435 | 0.589 |
| 909.28009514 | 0.593 |
| 909.44794882 | 0.594 |
| 909.61580455 | 0.595 |
| 909.78366231 | 0.594 |
| 909.95152211 | 0.595 |
| 910.11938394 | 0.596 |
| 910.2872478 | 0.6 |
| 910.45511369 | 0.604 |
| 910.62298159 | 0.61 |
| 910.79085152 | 0.613 |
| 910.95872347 | 0.615 |
| 911.12659743 | 0.616 |
| 911.29447341 | 0.619 |
| 911.46235139 | 0.623 |
| 911.63023138 | 0.627 |
| 911.79811337 | 0.63 |
| 911.96599737 | 0.633 |
| 912.13388336 | 0.635 |
| 912.30177135 | 0.638 |
| 912.46966133 | 0.64 |
| 912.63755329 | 0.644 |
| 912.80544725 | 0.647 |
| 912.97334318 | 0.65 |
| 913.1412411 | 0.652 |
| 913.309141 | 0.655 |
| 913.47704287 | 0.658 |
| 913.64494671 | 0.661 |
| 913.81285252 | 0.663 |
| 913.9807603 | 0.666 |
| 914.14867004 | 0.668 |
| 914.31658175 | 0.672 |
| 914.48449541 | 0.673 |
| 914.65241102 | 0.676 |
| 914.82032859 | 0.678 |
| 914.9882481 | 0.681 |
| 915.15616957 | 0.683 |
| 915.32409297 | 0.686 |
| 915.49201832 | 0.688 |
| 915.6599456 | 0.692 |
| 915.82787482 | 0.694 |
| 915.99580597 | 0.697 |
| 916.16373905 | 0.698 |
| 916.33167406 | 0.701 |
| 916.49961099 | 0.704 |
| 916.66754984 | 0.707 |
| 916.83549061 | 0.708 |
| 917.00343329 | 0.71 |
| 917.17137789 | 0.711 |
| 917.33932439 | 0.713 |
| 917.5072728 | 0.715 |
| 917.67522312 | 0.72 |
| 917.84317533 | 0.724 |
| 918.01112944 | 0.729 |
| 918.17908545 | 0.732 |
| 918.34704335 | 0.734 |
| 918.51500314 | 0.734 |
| 918.68296481 | 0.735 |
| 918.85092837 | 0.735 |
| 919.01889381 | 0.737 |
| 919.18686113 | 0.736 |
| 919.35483032 | 0.737 |
| 919.52280138 | 0.735 |
| 919.69077432 | 0.737 |
| 919.85874911 | 0.738 |
| 920.02672578 | 0.741 |
| 920.1947043 | 0.741 |
| 920.36268468 | 0.742 |
| 920.53066692 | 0.741 |
| 920.698651 | 0.741 |
| 920.86663694 | 0.741 |
| 921.03462472 | 0.741 |
| 921.20261435 | 0.743 |
| 921.37060582 | 0.747 |
| 921.53859912 | 0.75 |
| 921.70659426 | 0.753 |
| 921.87459123 | 0.754 |
| 922.04259003 | 0.757 |
| 922.21059066 | 0.758 |
| 922.37859311 | 0.762 |
| 922.54659738 | 0.766 |
| 922.71460347 | 0.771 |
| 922.88261138 | 0.774 |
| 923.05062109 | 0.777 |
| 923.21863262 | 0.779 |
| 923.38664595 | 0.781 |
| 923.55466108 | 0.782 |
| 923.72267802 | 0.784 |
| 923.89069675 | 0.784 |
| 924.05871728 | 0.786 |
| 924.2267396 | 0.786 |
| 924.39476371 | 0.789 |
| 924.5627896 | 0.791 |
| 924.73081728 | 0.794 |
| 924.89884674 | 0.799 |
| 925.06687797 | 0.804 |
| 925.23491099 | 0.808 |
| 925.40294577 | 0.813 |
| 925.57098232 | 0.815 |
| 925.73902064 | 0.817 |
| 925.90706072 | 0.815 |
| 926.07510257 | 0.815 |
| 926.24314617 | 0.812 |
| 926.41119152 | 0.812 |
| 926.57923863 | 0.812 |
| 926.74728749 | 0.813 |
| 926.91533809 | 0.814 |
| 927.08339044 | 0.815 |
| 927.25144452 | 0.816 |
| 927.41950035 | 0.819 |
| 927.58755791 | 0.822 |
| 927.7556172 | 0.827 |
| 927.92367822 | 0.83 |
| 928.09174097 | 0.834 |
| 928.25980544 | 0.836 |
| 928.42787163 | 0.839 |
| 928.59593954 | 0.839 |
| 928.76400916 | 0.841 |
| 928.9320805 | 0.843 |
| 929.10015354 | 0.846 |
| 929.26822829 | 0.848 |
| 929.43630475 | 0.849 |
| 929.6043829 | 0.848 |
| 929.77246275 | 0.85 |
| 929.9405443 | 0.852 |
| 930.10862754 | 0.856 |
| 930.27671247 | 0.859 |
| 930.44479908 | 0.863 |
| 930.61288738 | 0.865 |
| 930.78097736 | 0.869 |
| 930.94906902 | 0.873 |
| 931.11716235 | 0.876 |
| 931.28525735 | 0.878 |
| 931.45335402 | 0.882 |
| 931.62145236 | 0.885 |
| 931.78955237 | 0.888 |
| 931.95765403 | 0.889 |
| 932.12575735 | 0.891 |
| 932.29386232 | 0.89 |
| 932.46196895 | 0.891 |
| 932.63007723 | 0.89 |
| 932.79818715 | 0.891 |
| 932.96629872 | 0.89 |
| 933.13441192 | 0.892 |
| 933.30252677 | 0.892 |
| 933.47064325 | 0.894 |
| 933.63876136 | 0.894 |
| 933.8068811 | 0.896 |
| 933.97500246 | 0.897 |
| 934.14312545 | 0.899 |
| 934.31125006 | 0.899 |
| 934.47937629 | 0.901 |
| 934.64750413 | 0.901 |
| 934.81563359 | 0.904 |
| 934.98376465 | 0.906 |
| 935.15189732 | 0.908 |
| 935.3200316 | 0.907 |
| 935.48816747 | 0.907 |
| 935.65630494 | 0.906 |
| 935.82444401 | 0.907 |
| 935.99258467 | 0.908 |
| 936.16072691 | 0.91 |
| 936.32887075 | 0.911 |
| 936.49701617 | 0.913 |
| 936.66516316 | 0.916 |
| 936.83331174 | 0.921 |
| 937.00146189 | 0.924 |
| 937.16961361 | 0.926 |
| 937.3377669 | 0.925 |
| 937.50592176 | 0.924 |
| 937.67407818 | 0.923 |
| 937.84223616 | 0.925 |
| 938.0103957 | 0.925 |
| 938.1785568 | 0.927 |
| 938.34671944 | 0.928 |
| 938.51488364 | 0.93 |
| 938.68304938 | 0.932 |
| 938.85121666 | 0.934 |
| 939.01938549 | 0.935 |
| 939.18755585 | 0.936 |
| 939.35572775 | 0.936 |
| 939.52390118 | 0.937 |
| 939.69207614 | 0.937 |
| 939.86025262 | 0.939 |
| 940.02843063 | 0.94 |
| 940.19661016 | 0.942 |
| 940.36479121 | 0.943 |
| 940.53297377 | 0.946 |
| 940.70115784 | 0.947 |
| 940.86934343 | 0.948 |
| 941.03753051 | 0.949 |
| 941.20571911 | 0.95 |
| 941.3739092 | 0.95 |
| 941.54210079 | 0.95 |
| 941.71029388 | 0.95 |
| 941.87848845 | 0.952 |
| 942.04668452 | 0.953 |
| 942.21488207 | 0.956 |
| 942.38308111 | 0.959 |
| 942.55128162 | 0.963 |
| 942.71948362 | 0.965 |
| 942.88768709 | 0.968 |
| 943.05589203 | 0.971 |
| 943.22409844 | 0.974 |
| 943.39230631 | 0.975 |
| 943.56051565 | 0.977 |
| 943.72872645 | 0.978 |
| 943.89693871 | 0.978 |
| 944.06515242 | 0.978 |
| 944.23336759 | 0.978 |
| 944.4015842 | 0.978 |
| 944.56980226 | 0.979 |
| 944.73802176 | 0.98 |
| 944.90624271 | 0.984 |
| 945.07446509 | 0.987 |
| 945.24268891 | 0.99 |
| 945.41091415 | 0.992 |
| 945.57914083 | 0.994 |
| 945.74736893 | 0.995 |
| 945.91559846 | 0.995 |
| 946.08382941 | 0.994 |
| 946.25206177 | 0.993 |
| 946.42029555 | 0.991 |
| 946.58853074 | 0.99 |
| 946.75676735 | 0.988 |
| 946.92500535 | 0.988 |
| 947.09324476 | 0.987 |
| 947.26148557 | 0.987 |
| 947.42972778 | 0.985 |
| 947.59797138 | 0.985 |
| 947.76621638 | 0.985 |
| 947.93446276 | 0.987 |
| 948.10271054 | 0.987 |
| 948.27095969 | 0.989 |
| 948.43921022 | 0.99 |
| 948.60746214 | 0.99 |
| 948.77571542 | 0.99 |
| 948.94397008 | 0.99 |
| 949.11222611 | 0.99 |
| 949.2804835 | 0.991 |
| 949.44874226 | 0.991 |
| 949.61700238 | 0.992 |
| 949.78526385 | 0.993 |
| 949.95352668 | 0.996 |
| 950.12179087 | 0.998 |
| 950.2900564 | 1 |
| 950.45832328 | 1 |
| 950.6265915 | 1 |
| 950.79486106 | 0.998 |
| 950.96313196 | 0.997 |
| 951.13140419 | 0.994 |
| 951.29967776 | 0.992 |
| 951.46795265 | 0.989 |
| 951.63622887 | 0.988 |
| 951.80450642 | 0.987 |
| 951.97278528 | 0.986 |
| 952.14106546 | 0.985 |
| 952.30934696 | 0.983 |
| 952.47762977 | 0.981 |
| 952.64591389 | 0.978 |
| 952.81419931 | 0.976 |
| 952.98248604 | 0.973 |
| 953.15077407 | 0.972 |
| 953.3190634 | 0.971 |
| 953.48735402 | 0.971 |
| 953.65564593 | 0.97 |
| 953.82393913 | 0.969 |
| 953.99223362 | 0.966 |
| 954.16052939 | 0.965 |
| 954.32882644 | 0.963 |
| 954.49712477 | 0.96 |
| 954.66542438 | 0.957 |
| 954.83372525 | 0.955 |
| 955.0020274 | 0.953 |
| 955.17033081 | 0.95 |
| 955.33863548 | 0.946 |
| 955.50694142 | 0.943 |
| 955.67524861 | 0.94 |
| 955.84355706 | 0.939 |
| 956.01186676 | 0.937 |
| 956.18017771 | 0.937 |
| 956.3484899 | 0.937 |
| 956.51680334 | 0.936 |
| 956.68511802 | 0.933 |
| 956.85343394 | 0.93 |
| 957.02175109 | 0.924 |
| 957.19006947 | 0.919 |
| 957.35838908 | 0.914 |
| 957.52670992 | 0.91 |
| 957.69503198 | 0.906 |
| 957.86335526 | 0.902 |
| 958.03167976 | 0.897 |
| 958.20000548 | 0.893 |
| 958.3683324 | 0.888 |
| 958.53666054 | 0.885 |
| 958.70498988 | 0.88 |
| 958.87332043 | 0.877 |
| 959.04165217 | 0.873 |
| 959.20998511 | 0.87 |
| 959.37831925 | 0.866 |
| 959.54665458 | 0.863 |
| 959.7149911 | 0.858 |
| 959.88332881 | 0.855 |
| 960.05166769 | 0.852 |
| 960.22000776 | 0.85 |
| 960.38834901 | 0.844 |
| 960.55669143 | 0.838 |
| 960.72503502 | 0.832 |
| 960.89337978 | 0.827 |
| 961.06172571 | 0.822 |
| 961.2300728 | 0.817 |
| 961.39842106 | 0.811 |
| 961.56677047 | 0.805 |
| 961.73512103 | 0.798 |
| 961.90347275 | 0.791 |
| 962.07182561 | 0.784 |
| 962.24017962 | 0.778 |
| 962.40853478 | 0.771 |
| 962.57689107 | 0.764 |
| 962.74524851 | 0.755 |
| 962.91360707 | 0.746 |
| 963.08196677 | 0.736 |
| 963.2503276 | 0.729 |
| 963.41868956 | 0.722 |
| 963.58705264 | 0.716 |
| 963.75541683 | 0.71 |
| 963.92378215 | 0.703 |
| 964.09214858 | 0.695 |
| 964.26051612 | 0.688 |
| 964.42888478 | 0.68 |
| 964.59725453 | 0.673 |
| 964.7656254 | 0.665 |
| 964.93399736 | 0.658 |
| 965.10237042 | 0.65 |
| 965.27074457 | 0.645 |
| 965.43911982 | 0.639 |
| 965.60749615 | 0.633 |
| 965.77587357 | 0.625 |
| 965.94425208 | 0.617 |
| 966.11263166 | 0.607 |
| 966.28101233 | 0.596 |
| 966.44939406 | 0.585 |
| 966.61777687 | 0.576 |
| 966.78616075 | 0.567 |
| 966.9545457 | 0.559 |
| 967.1229317 | 0.551 |
| 967.29131877 | 0.543 |
| 967.4597069 | 0.534 |
| 967.62809608 | 0.525 |
| 967.79648631 | 0.516 |
| 967.96487759 | 0.507 |
| 968.13326992 | 0.498 |
| 968.30166329 | 0.49 |
| 968.4700577 | 0.481 |
| 968.63845315 | 0.474 |
| 968.80684963 | 0.466 |
| 968.97524715 | 0.459 |
| 969.14364569 | 0.451 |
| 969.31204527 | 0.443 |
| 969.48044586 | 0.434 |
| 969.64884747 | 0.427 |
| 969.81725011 | 0.42 |
| 969.98565375 | 0.414 |
| 970.15405841 | 0.406 |
| 970.32246408 | 0.398 |
| 970.49087075 | 0.39 |
| 970.65927843 | 0.383 |
| 970.82768711 | 0.376 |
| 970.99609678 | 0.369 |
| 971.16450745 | 0.362 |
| 971.33291912 | 0.356 |
| 971.50133177 | 0.35 |
| 971.6697454 | 0.345 |
| 971.83816002 | 0.339 |
| 972.00657562 | 0.334 |
| 972.1749922 | 0.328 |
| 972.34340976 | 0.323 |
| 972.51182828 | 0.317 |
| 972.68024778 | 0.312 |
| 972.84866824 | 0.306 |
| 973.01708966 | 0.301 |
| 973.18551204 | 0.296 |
| 973.35393538 | 0.291 |
| 973.52235968 | 0.286 |
| 973.69078493 | 0.282 |
| 973.85921113 | 0.277 |
| 974.02763827 | 0.272 |
| 974.19606636 | 0.266 |
| 974.36449538 | 0.261 |
| 974.53292535 | 0.255 |
| 974.70135625 | 0.25 |
| 974.86978808 | 0.245 |
| 975.03822084 | 0.24 |
| 975.20665452 | 0.236 |
| 975.37508913 | 0.232 |
| 975.54352466 | 0.228 |
| 975.71196111 | 0.224 |
| 975.88039847 | 0.22 |
| 976.04883675 | 0.216 |
| 976.21727593 | 0.212 |
| 976.38571602 | 0.207 |
| 976.55415701 | 0.202 |
| 976.72259891 | 0.198 |
| 976.8910417 | 0.194 |
| 977.05948538 | 0.19 |
| 977.22792996 | 0.186 |
| 977.39637542 | 0.183 |
| 977.56482178 | 0.179 |
| 977.73326901 | 0.176 |
| 977.90171713 | 0.172 |
| 978.07016612 | 0.17 |
| 978.23861599 | 0.167 |
| 978.40706673 | 0.165 |
| 978.57551834 | 0.162 |
| 978.74397082 | 0.16 |
| 978.91242415 | 0.157 |
| 979.08087835 | 0.154 |
| 979.24933341 | 0.151 |
| 979.41778932 | 0.148 |
| 979.58624608 | 0.144 |
| 979.7547037 | 0.141 |
| 979.92316215 | 0.138 |
| 980.09162146 | 0.136 |
| 980.2600816 | 0.133 |
| 980.42854258 | 0.131 |
| 980.59700439 | 0.128 |
| 980.76546704 | 0.126 |
| 980.93393051 | 0.123 |
| 981.10239481 | 0.121 |
| 981.27085994 | 0.118 |
| 981.43932588 | 0.116 |
| 981.60779265 | 0.113 |
| 981.77626022 | 0.111 |
| 981.94472861 | 0.109 |
| 982.11319781 | 0.107 |
| 982.28166781 | 0.104 |
| 982.45013862 | 0.102 |
| 982.61861023 | 0.1 |
| 982.78708263 | 0.099 |
| 982.95555583 | 0.097 |
| 983.12402983 | 0.095 |
| 983.29250461 | 0.093 |
| 983.46098017 | 0.091 |
| 983.62945652 | 0.089 |
| 983.79793366 | 0.087 |
| 983.96641156 | 0.085 |
| 984.13489025 | 0.084 |
| 984.3033697 | 0.082 |
| 984.47184993 | 0.081 |
| 984.64033092 | 0.079 |
| 984.80881267 | 0.077 |
| 984.97729518 | 0.076 |
| 985.14577845 | 0.074 |
| 985.31426248 | 0.072 |
| 985.48274726 | 0.071 |
| 985.65123278 | 0.069 |
| 985.81971906 | 0.068 |
| 985.98820607 | 0.066 |
| 986.15669383 | 0.065 |
| 986.32518232 | 0.064 |
| 986.49367155 | 0.063 |
| 986.66216151 | 0.061 |
| 986.8306522 | 0.06 |
| 986.99914362 | 0.059 |
| 987.16763575 | 0.057 |
| 987.33612861 | 0.056 |
| 987.50462219 | 0.055 |
| 987.67311648 | 0.054 |
| 987.84161149 | 0.053 |
| 988.0101072 | 0.052 |
| 988.17860362 | 0.051 |
| 988.34710074 | 0.05 |
| 988.51559856 | 0.049 |
| 988.68409708 | 0.048 |
| 988.85259629 | 0.047 |
| 989.0210962 | 0.045 |
| 989.18959679 | 0.044 |
| 989.35809808 | 0.043 |
| 989.52660004 | 0.041 |
| 989.69510269 | 0.04 |
| 989.86360601 | 0.039 |
| 990.03211 | 0.037 |
| 990.20061467 | 0.037 |
| 990.36912001 | 0.035 |
| 990.53762601 | 0.035 |
| 990.70613268 | 0.034 |
| 990.87464001 | 0.034 |
| 991.04314799 | 0.033 |
| 991.21165663 | 0.033 |
| 991.38016593 | 0.033 |
| 991.54867587 | 0.033 |
| 991.71718645 | 0.033 |
| 991.88569768 | 0.034 |
| 992.05420955 | 0.035 |
| 992.22272206 | 0.035 |
| 992.3912352 | 0.035 |
| 992.55974898 | 0.034 |
| 992.72826338 | 0.034 |
| 992.89677841 | 0.031 |
| 993.06529406 | 0.031 |
| 993.23381034 | 0.029 |
| 993.40232723 | 0.028 |
| 993.57084473 | 0.027 |
| 993.73936285 | 0.027 |
| 993.90788157 | 0.027 |
| 994.07640091 | 0.027 |
| 994.24492084 | 0.028 |
| 994.41344138 | 0.027 |
| 994.58196251 | 0.026 |
| 994.75048424 | 0.026 |
| 994.91900656 | 0.025 |
| 995.08752947 | 0.025 |
| 995.25605296 | 0.022 |
| 995.42457704 | 0.022 |
| 995.5931017 | 0.019 |
| 995.76162693 | 0.02 |
| 995.93015274 | 0.018 |
| 996.09867913 | 0.018 |
| 996.26720608 | 0.016 |
| 996.4357336 | 0.016 |
| 996.60426168 | 0.015 |
| 996.77279032 | 0.015 |
| 996.94131952 | 0.014 |
| 997.10984927 | 0.014 |
| 997.27837957 | 0.014 |
| 997.44691043 | 0.014 |
| 997.61544183 | 0.014 |
| 997.78397377 | 0.015 |
| 997.95250625 | 0.015 |
| 998.12103928 | 0.016 |
| 998.28957283 | 0.016 |
| 998.45810692 | 0.016 |
| 998.62664154 | 0.016 |
| 998.79517668 | 0.016 |
| 998.96371234 | 0.016 |
| 999.13224853 | 0.016 |
| 999.30078523 | 0.017 |
| 999.46932245 | 0.016 |
| 999.63786018 | 0.016 |
| 999.80639842 | 0.016 |
| 999.97493717 | 0.016 |
| 1000.14347642 | 0.015 |
| 1000.31201616 | 0.016 |
| 1000.48055641 | 0.015 |
| 1000.64909715 | 0.016 |
| 1000.81763838 | 0.015 |
| 1000.98618011 | 0.015 |
| 1001.15472231 | 0.014 |
| 1001.323265 | 0.015 |
| 1001.49180818 | 0.014 |
| 1001.66035182 | 0.015 |
| 1001.82889595 | 0.014 |
| 1001.99744054 | 0.015 |
| 1002.16598561 | 0.014 |
| 1002.33453114 | 0.015 |
| 1002.50307713 | 0.014 |
| 1002.67162359 | 0.015 |
| 1002.8401705 | 0.014 |
| 1003.00871786 | 0.015 |
| 1003.17726568 | 0.014 |
| 1003.34581395 | 0.015 |
| 1003.51436266 | 0.014 |
| 1003.68291182 | 0.015 |
| 1003.85146141 | 0.014 |
| 1004.02001145 | 0.015 |
| 1004.18856191 | 0.015 |
| 1004.35711282 | 0.015 |
| 1004.52566414 | 0.015 |
| 1004.6942159 | 0.015 |
| 1004.86276808 | 0.015 |
| 1005.03132068 | 0.015 |
| 1005.19987369 | 0.015 |
| 1005.36842712 | 0.015 |
| 1005.53698097 | 0.015 |
| 1005.70553522 | 0.015 |
| 1005.87408988 | 0.015 |
| 1006.04264494 | 0.015 |
| 1006.2112004 | 0.015 |
| 1006.37975626 | 0.015 |
| 1006.54831251 | 0.015 |
| 1006.71686916 | 0.015 |
| 1006.88542619 | 0.015 |
| 1007.05398361 | 0.015 |
| 1007.22254141 | 0.015 |
| 1007.3910996 | 0.015 |
| 1007.55965816 | 0.015 |
| 1007.7282171 | 0.015 |
| 1007.8967764 | 0.015 |
| 1008.06533608 | 0.015 |
| 1008.23389612 | 0.014 |
| 1008.40245653 | 0.014 |
| 1008.57101729 | 0.014 |
| 1008.73957842 | 0.014 |
| 1008.9081399 | 0.014 |
| 1009.07670173 | 0.014 |
| 1009.24526391 | 0.014 |
| 1009.41382643 | 0.014 |
| 1009.5823893 | 0.014 |
| 1009.75095251 | 0.014 |
| 1009.91951605 | 0.014 |
| 1010.08807993 | 0.014 |
| 1010.25664415 | 0.014 |
| 1010.42520869 | 0.014 |
| 1010.59377356 | 0.014 |
| 1010.76233875 | 0.013 |
| 1010.93090426 | 0.013 |
| 1011.09947009 | 0.013 |
| 1011.26803623 | 0.013 |
| 1011.43660268 | 0.013 |
| 1011.60516945 | 0.013 |
| 1011.77373652 | 0.013 |
| 1011.94230389 | 0.013 |
| 1012.11087156 | 0.013 |
| 1012.27943953 | 0.013 |
| 1012.4480078 | 0.012 |
| 1012.61657636 | 0.012 |
| 1012.7851452 | 0.012 |
| 1012.95371433 | 0.012 |
| 1013.12228375 | 0.012 |
| 1013.29085345 | 0.012 |
| 1013.45942342 | 0.012 |
| 1013.62799367 | 0.012 |
| 1013.79656419 | 0.012 |
| 1013.96513497 | 0.012 |
| 1014.13370603 | 0.011 |
| 1014.30227735 | 0.011 |
| 1014.47084892 | 0.011 |
| 1014.63942076 | 0.011 |
| 1014.80799285 | 0.011 |
| 1014.97656519 | 0.011 |
| 1015.14513778 | 0.011 |
| 1015.31371062 | 0.011 |
| 1015.4822837 | 0.011 |
| 1015.65085702 | 0.011 |
| 1015.81943058 | 0.011 |
| 1015.98800437 | 0.011 |
| 1016.15657839 | 0.01 |
| 1016.32515265 | 0.011 |
| 1016.49372713 | 0.01 |
| 1016.66230183 | 0.01 |
| 1016.83087675 | 0.01 |
| 1016.99945189 | 0.011 |
| 1017.16802725 | 0.01 |
| 1017.33660281 | 0.01 |
| 1017.50517859 | 0.01 |
| 1017.67375457 | 0.01 |
| 1017.84233075 | 0.01 |
| 1018.01090714 | 0.01 |
| 1018.17948372 | 0.01 |
| 1018.3480605 | 0.01 |
| 1018.51663746 | 0.009 |
| 1018.68521462 | 0.01 |
| 1018.85379197 | 0.009 |
| 1019.02236949 | 0.01 |
| 1019.1909472 | 0.009 |
| 1019.35952508 | 0.01 |
| 1019.52810314 | 0.009 |
| 1019.69668137 | 0.009 |
| 1019.86525977 | 0.009 |
| 1020.03383834 | 0.009 |
| 1020.20241707 | 0.009 |
| 1020.37099596 | 0.009 |
| 1020.539575 | 0.008 |
| 1020.7081542 | 0.009 |
| 1020.87673356 | 0.009 |
| 1021.04531306 | 0.009 |
| 1021.21389271 | 0.009 |
| 1021.3824725 | 0.009 |
| 1021.55105243 | 0.008 |
| 1021.7196325 | 0.009 |
| 1021.8882127 | 0.008 |
| 1022.05679304 | 0.009 |
| 1022.2253735 | 0.008 |
| 1022.39395409 | 0.008 |
| 1022.5625348 | 0.008 |
| 1022.73111564 | 0.008 |
| 1022.89969659 | 0.008 |
| 1023.06827765 | 0.008 |
| 1023.23685883 | 0.008 |
| 1023.40544012 | 0.008 |
| 1023.57402151 | 0.008 |
| 1023.74260301 | 0.008 |
| 1023.9111846 | 0.008 |
| 1024.07976629 | 0.008 |
| 1024.24834808 | 0.008 |
| 1024.41692996 | 0.008 |
| 1024.58551193 | 0.008 |
| 1024.75409398 | 0.008 |
| 1024.92267612 | 0.008 |
| 1025.09125834 | 0.008 |
| 1025.25984063 | 0.008 |
| 1025.428423 | 0.008 |
| 1025.59700545 | 0.008 |
| 1025.76558796 | 0.008 |
| 1025.93417053 | 0.008 |
| 1026.10275317 | 0.008 |
| 1026.27133587 | 0.008 |
| 1026.43991863 | 0.008 |
| 1026.60850144 | 0.008 |
| 1026.7770843 | 0.008 |
| 1026.94566722 | 0.008 |
| 1027.11425018 | 0.008 |
| 1027.28283318 | 0.007 |
| 1027.45141622 | 0.008 |
| 1027.6199993 | 0.008 |
| 1027.78858241 | 0.008 |
| 1027.95716556 | 0.007 |
| 1028.12574873 | 0.008 |
| 1028.29433193 | 0.007 |
| 1028.46291516 | 0.008 |
| 1028.6314984 | 0.007 |
| 1028.80008166 | 0.008 |
| 1028.96866494 | 0.007 |
| 1029.13724823 | 0.007 |
| 1029.30583152 | 0.007 |
| 1029.47441482 | 0.007 |
| 1029.64299813 | 0.007 |
| 1029.81158144 | 0.008 |
| 1029.98016474 | 0.007 |
| 1030.14874804 | 0.007 |
| 1030.31733133 | 0.007 |
| 1030.48591461 | 0.007 |
| 1030.65449787 | 0.007 |
| 1030.82308112 | 0.007 |
| 1030.99166435 | 0.007 |
| 1031.16024755 | 0.008 |
| 1031.32883073 | 0.007 |
| 1031.49741388 | 0.008 |
| 1031.665997 | 0.007 |
| 1031.83458009 | 0.008 |
| 1032.00316314 | 0.007 |
| 1032.17174615 | 0.008 |
| 1032.34032912 | 0.007 |
| 1032.50891204 | 0.008 |
| 1032.67749491 | 0.007 |
| 1032.84607774 | 0.008 |
| 1033.0146605 | 0.007 |
| 1033.18324322 | 0.007 |
| 1033.35182587 | 0.007 |
| 1033.52040846 | 0.007 |
| 1033.68899098 | 0.007 |
| 1033.85757344 | 0.007 |
| 1034.02615582 | 0.007 |
| 1034.19473813 | 0.007 |
| 1034.36332036 | 0.007 |
| 1034.53190252 | 0.008 |
| 1034.70048459 | 0.007 |
| 1034.86906658 | 0.007 |
| 1035.03764847 | 0.007 |
| 1035.20623028 | 0.007 |
| 1035.37481199 | 0.007 |
| 1035.54339361 | 0.007 |
| 1035.71197512 | 0.007 |
| 1035.88055654 | 0.007 |
| 1036.04913784 | 0.007 |
| 1036.21771904 | 0.007 |
| 1036.38630013 | 0.007 |
| 1036.55488111 | 0.007 |
| 1036.72346196 | 0.007 |
| 1036.8920427 | 0.007 |
| 1037.06062332 | 0.007 |
| 1037.22920381 | 0.007 |
| 1037.39778417 | 0.007 |
| 1037.5663644 | 0.007 |
| 1037.73494449 | 0.007 |
| 1037.90352445 | 0.007 |
| 1038.07210427 | 0.007 |
| 1038.24068395 | 0.007 |
| 1038.40926348 | 0.007 |
| 1038.57784286 | 0.007 |
| 1038.7464221 | 0.007 |
| 1038.91500117 | 0.007 |
| 1039.08358009 | 0.007 |
| 1039.25215886 | 0.007 |
| 1039.42073745 | 0.007 |
| 1039.58931589 | 0.007 |
| 1039.75789415 | 0.007 |
| 1039.92647225 | 0.007 |
| 1040.09505017 | 0.007 |
| 1040.26362791 | 0.007 |
| 1040.43220547 | 0.008 |
| 1040.60078285 | 0.007 |
| 1040.76936005 | 0.007 |
| 1040.93793705 | 0.007 |
| 1041.10651387 | 0.007 |
| 1041.27509049 | 0.007 |
| 1041.44366692 | 0.007 |
| 1041.61224314 | 0.007 |
| 1041.78081916 | 0.007 |
| 1041.94939498 | 0.007 |
| 1042.11797059 | 0.007 |
| 1042.28654599 | 0.007 |
| 1042.45512117 | 0.007 |
| 1042.62369614 | 0.007 |
| 1042.79227088 | 0.007 |
| 1042.96084541 | 0.007 |
| 1043.12941971 | 0.007 |
| 1043.29799378 | 0.007 |
| 1043.46656762 | 0.007 |
| 1043.63514122 | 0.007 |
| 1043.80371459 | 0.007 |
| 1043.97228772 | 0.007 |
| 1044.1408606 | 0.007 |
| 1044.30943324 | 0.007 |
| 1044.47800564 | 0.007 |
| 1044.64657778 | 0.007 |
| 1044.81514966 | 0.007 |
| 1044.98372129 | 0.007 |
| 1045.15229266 | 0.007 |
| 1045.32086377 | 0.007 |
| 1045.48943461 | 0.007 |
| 1045.65800519 | 0.007 |
| 1045.82657549 | 0.007 |
| 1045.99514552 | 0.007 |
| 1046.16371527 | 0.007 |
| 1046.33228474 | 0.007 |
| 1046.50085393 | 0.007 |
| 1046.66942284 | 0.007 |
| 1046.83799145 | 0.007 |
| 1047.00655978 | 0.007 |
| 1047.17512781 | 0.007 |
| 1047.34369554 | 0.007 |
| 1047.51226297 | 0.007 |
| 1047.6808301 | 0.007 |
| 1047.84939693 | 0.007 |
| 1048.01796345 | 0.007 |
| 1048.18652965 | 0.007 |
| 1048.35509554 | 0.007 |
| 1048.52366112 | 0.007 |
| 1048.69222637 | 0.007 |
| 1048.86079131 | 0.007 |
| 1049.02935591 | 0.007 |
| 1049.19792019 | 0.007 |
| 1049.36648414 | 0.007 |
| 1049.53504775 | 0.007 |
| 1049.70361103 | 0.007 |
| 1049.87217397 | 0.007 |
| 1050.04073656 | 0.007 |
| 1050.20929881 | 0.007 |
| 1050.37786071 | 0.007 |
| 1050.54642226 | 0.007 |
| 1050.71498346 | 0.007 |
| 1050.88354429 | 0.007 |
| 1051.05210477 | 0.007 |
| 1051.22066489 | 0.008 |
| 1051.38922464 | 0.007 |
| 1051.55778402 | 0.008 |
| 1051.72634303 | 0.007 |
| 1051.89490167 | 0.007 |
| 1052.06345993 | 0.007 |
| 1052.23201781 | 0.007 |
| 1052.40057531 | 0.007 |
| 1052.56913242 | 0.007 |
| 1052.73768914 | 0.007 |
| 1052.90624548 | 0.008 |
| 1053.07480141 | 0.007 |
| 1053.24335696 | 0.007 |
| 1053.4119121 | 0.007 |
| 1053.58046684 | 0.007 |
| 1053.74902117 | 0.007 |
| 1053.9175751 | 0.008 |
| 1054.08612861 | 0.007 |
| 1054.25468171 | 0.008 |
| 1054.42323439 | 0.007 |
| 1054.59178666 | 0.008 |
| 1054.7603385 | 0.007 |
| 1054.92888991 | 0.007 |
| 1055.0974409 | 0.007 |
| 1055.26599145 | 0.007 |
| 1055.43454158 | 0.007 |
| 1055.60309126 | 0.007 |
| 1055.7716405 | 0.007 |
| 1055.94018931 | 0.007 |
| 1056.10873766 | 0.007 |
| 1056.27728557 | 0.007 |
| 1056.44583303 | 0.007 |
| 1056.61438003 | 0.007 |
| 1056.78292658 | 0.007 |
| 1056.95147266 | 0.008 |
| 1057.12001829 | 0.007 |
| 1057.28856345 | 0.008 |
| 1057.45710814 | 0.007 |
| 1057.62565235 | 0.008 |
| 1057.7941961 | 0.007 |
| 1057.96273937 | 0.008 |
| 1058.13128215 | 0.007 |
| 1058.29982446 | 0.007 |
| 1058.46836628 | 0.007 |
| 1058.63690761 | 0.007 |
| 1058.80544845 | 0.007 |
| 1058.9739888 | 0.007 |
| 1059.14252865 | 0.007 |
| 1059.311068 | 0.008 |
| 1059.47960684 | 0.007 |
| 1059.64814518 | 0.008 |
| 1059.81668302 | 0.007 |
| 1059.98522034 | 0.007 |
| 1060.15375714 | 0.007 |
| 1060.32229344 | 0.007 |
| 1060.49082921 | 0.007 |
| 1060.65936445 | 0.008 |
| 1060.82789918 | 0.007 |
| 1060.99643337 | 0.008 |
| 1061.16496703 | 0.008 |
| 1061.33350016 | 0.008 |
| 1061.50203275 | 0.008 |
| 1061.67056481 | 0.008 |
| 1061.83909632 | 0.008 |
| 1062.00762728 | 0.008 |
| 1062.1761577 | 0.008 |
| 1062.34468756 | 0.008 |
| 1062.51321687 | 0.008 |
| 1062.68174562 | 0.008 |
| 1062.85027382 | 0.008 |
| 1063.01880145 | 0.008 |
| 1063.18732851 | 0.008 |
| 1063.35585501 | 0.008 |
| 1063.52438094 | 0.008 |
| 1063.69290629 | 0.008 |
| 1063.86143106 | 0.008 |
| 1064.02995526 | 0.008 |
| 1064.19847887 | 0.008 |
| 1064.3670019 | 0.008 |
| 1064.53552433 | 0.008 |
| 1064.70404618 | 0.009 |
| 1064.87256744 | 0.009 |
| 1065.04108809 | 0.009 |
| 1065.20960815 | 0.01 |
| 1065.3781276 | 0.01 |
| 1065.54664645 | 0.01 |
| 1065.71516469 | 0.011 |
| 1065.88368232 | 0.01 |
| 1066.05219933 | 0.011 |
| 1066.22071573 | 0.011 |
| 1066.38923151 | 0.012 |
| 1066.55774666 | 0.012 |
| 1066.72626119 | 0.012 |
| 1066.89477509 | 0.012 |
| 1067.06328836 | 0.013 |
| 1067.231801 | 0.014 |
| 1067.400313 | 0.014 |
| 1067.56882436 | 0.014 |
| 1067.73733507 | 0.015 |
| 1067.90584514 | 0.015 |
| 1068.07435456 | 0.015 |
| 1068.24286334 | 0.015 |
| 1068.41137145 | 0.015 |
| 1068.57987891 | 0.015 |
| 1068.74838571 | 0.015 |
| 1068.91689185 | 0.015 |
| 1069.08539732 | 0.015 |
| 1069.25390213 | 0.015 |
| 1069.42240626 | 0.015 |
| 1069.59090972 | 0.015 |
| 1069.7594125 | 0.014 |
| 1069.9279146 | 0.015 |
| 1070.09641602 | 0.014 |
| 1070.26491675 | 0.015 |
| 1070.4334168 | 0.014 |
| 1070.60191615 | 0.015 |
| 1070.77041481 | 0.014 |
| 1070.93891277 | 0.015 |
| 1071.10741003 | 0.014 |
| 1071.27590659 | 0.015 |
| 1071.44440245 | 0.015 |
| 1071.6128976 | 0.015 |
| 1071.78139203 | 0.015 |
| 1071.94988575 | 0.015 |
| 1072.11837875 | 0.015 |
| 1072.28687104 | 0.015 |
| 1072.4553626 | 0.015 |
| 1072.62385344 | 0.015 |
| 1072.79234354 | 0.015 |
| 1072.96083292 | 0.015 |
| 1073.12932156 | 0.015 |
| 1073.29780947 | 0.015 |
| 1073.46629663 | 0.015 |
| 1073.63478305 | 0.015 |
| 1073.80326873 | 0.015 |
| 1073.97175366 | 0.015 |
| 1074.14023784 | 0.015 |
| 1074.30872126 | 0.015 |
| 1074.47720393 | 0.015 |
| 1074.64568583 | 0.015 |
| 1074.81416697 | 0.015 |
| 1074.98264735 | 0.015 |
| 1075.15112696 | 0.015 |
| 1075.3196058 | 0.015 |
| 1075.48808387 | 0.015 |
| 1075.65656115 | 0.015 |
| 1075.82503766 | 0.015 |
| 1075.99351338 | 0.015 |
| 1076.16198832 | 0.015 |
| 1076.33046247 | 0.015 |
| 1076.49893583 | 0.015 |
| 1076.6674084 | 0.015 |
| 1076.83588017 | 0.015 |
| 1077.00435114 | 0.015 |
| 1077.1728213 | 0.015 |
| 1077.34129066 | 0.015 |
| 1077.50975922 | 0.015 |
| 1077.67822696 | 0.015 |
| 1077.84669388 | 0.015 |
| 1078.01515999 | 0.015 |
| 1078.18362528 | 0.015 |
| 1078.35208975 | 0.015 |
| 1078.52055339 | 0.015 |
| 1078.6890162 | 0.015 |
| 1078.85747818 | 0.015 |
| 1079.02593933 | 0.015 |
| 1079.19439964 | 0.015 |
| 1079.36285911 | 0.015 |
| 1079.53131774 | 0.015 |
| 1079.69977552 | 0.015 |
| 1079.86823246 | 0.015 |
| 1080.03668854 | 0.015 |
| 1080.20514377 | 0.015 |
| 1080.37359814 | 0.015 |
| 1080.54205165 | 0.015 |
| 1080.7105043 | 0.015 |
| 1080.87895609 | 0.015 |
| 1081.047407 | 0.015 |
| 1081.21585705 | 0.015 |
| 1081.38430622 | 0.015 |
| 1081.55275451 | 0.015 |
| 1081.72120192 | 0.015 |
| 1081.88964845 | 0.015 |
| 1082.0580941 | 0.015 |
| 1082.22653885 | 0.015 |
| 1082.39498272 | 0.015 |
| 1082.56342569 | 0.015 |
| 1082.73186776 | 0.015 |
| 1082.90030894 | 0.015 |
| 1083.06874921 | 0.015 |
| 1083.23718857 | 0.015 |
| 1083.40562703 | 0.015 |
| 1083.57406458 | 0.015 |
| 1083.74250121 | 0.015 |
| 1083.91093692 | 0.015 |
| 1084.07937172 | 0.015 |
| 1084.24780559 | 0.015 |
| 1084.41623854 | 0.015 |
| 1084.58467055 | 0.015 |
| 1084.75310164 | 0.015 |
| 1084.92153179 | 0.015 |
| 1085.08996101 | 0.015 |
| 1085.25838929 | 0.015 |
| 1085.42681662 | 0.015 |
| 1085.59524301 | 0.015 |
| 1085.76366844 | 0.015 |
| 1085.93209293 | 0.015 |
| 1086.10051647 | 0.015 |
| 1086.26893904 | 0.015 |
| 1086.43736066 | 0.015 |
| 1086.60578131 | 0.015 |
| 1086.774201 | 0.015 |
| 1086.94261972 | 0.015 |
| 1087.11103747 | 0.015 |
| 1087.27945425 | 0.015 |
| 1087.44787004 | 0.015 |
| 1087.61628486 | 0.015 |
| 1087.7846987 | 0.015 |
| 1087.95311155 | 0.015 |
| 1088.12152341 | 0.014 |
| 1088.28993428 | 0.015 |
| 1088.45834415 | 0.014 |
| 1088.62675303 | 0.015 |
| 1088.79516091 | 0.014 |
| 1088.96356779 | 0.015 |
| 1089.13197366 | 0.014 |
| 1089.30037852 | 0.015 |
| 1089.46878237 | 0.015 |
| 1089.63718521 | 0.015 |
| 1089.80558702 | 0.015 |
| 1089.97398782 | 0.015 |
| 1090.1423876 | 0.015 |
| 1090.31078635 | 0.015 |
| 1090.47918408 | 0.015 |
| 1090.64758077 | 0.015 |
| 1090.81597642 | 0.015 |
| 1090.98437104 | 0.015 |
| 1091.15276462 | 0.015 |
| 1091.32115716 | 0.015 |
| 1091.48954865 | 0.015 |
| 1091.6579391 | 0.015 |
| 1091.82632849 | 0.015 |
| 1091.99471683 | 0.015 |
| 1092.16310411 | 0.015 |
| 1092.33149033 | 0.015 |
| 1092.49987549 | 0.015 |
| 1092.66825958 | 0.015 |
| 1092.83664261 | 0.015 |
| 1093.00502456 | 0.015 |
| 1093.17340544 | 0.015 |
| 1093.34178524 | 0.015 |
| 1093.51016396 | 0.015 |
| 1093.6785416 | 0.015 |
| 1093.84691816 | 0.015 |
| 1094.01529362 | 0.015 |
| 1094.183668 | 0.015 |
| 1094.35204128 | 0.015 |
| 1094.52041346 | 0.015 |
| 1094.68878454 | 0.015 |
| 1094.85715452 | 0.015 |
| 1095.0255234 | 0.015 |
| 1095.19389116 | 0.015 |
| 1095.36225782 | 0.015 |
| 1095.53062336 | 0.015 |
| 1095.69898778 | 0.015 |
| 1095.86735109 | 0.013 |
| 1096.03571327 | 0.008 |
| 1096.20407432 | 0.003 |
| 1096.37243425 | 0 |
| 1096.54079304 | 0 |
| 1096.70915071 | 0 |
| 1096.87750723 | 0 |
| 1097.04586261 | 0 |